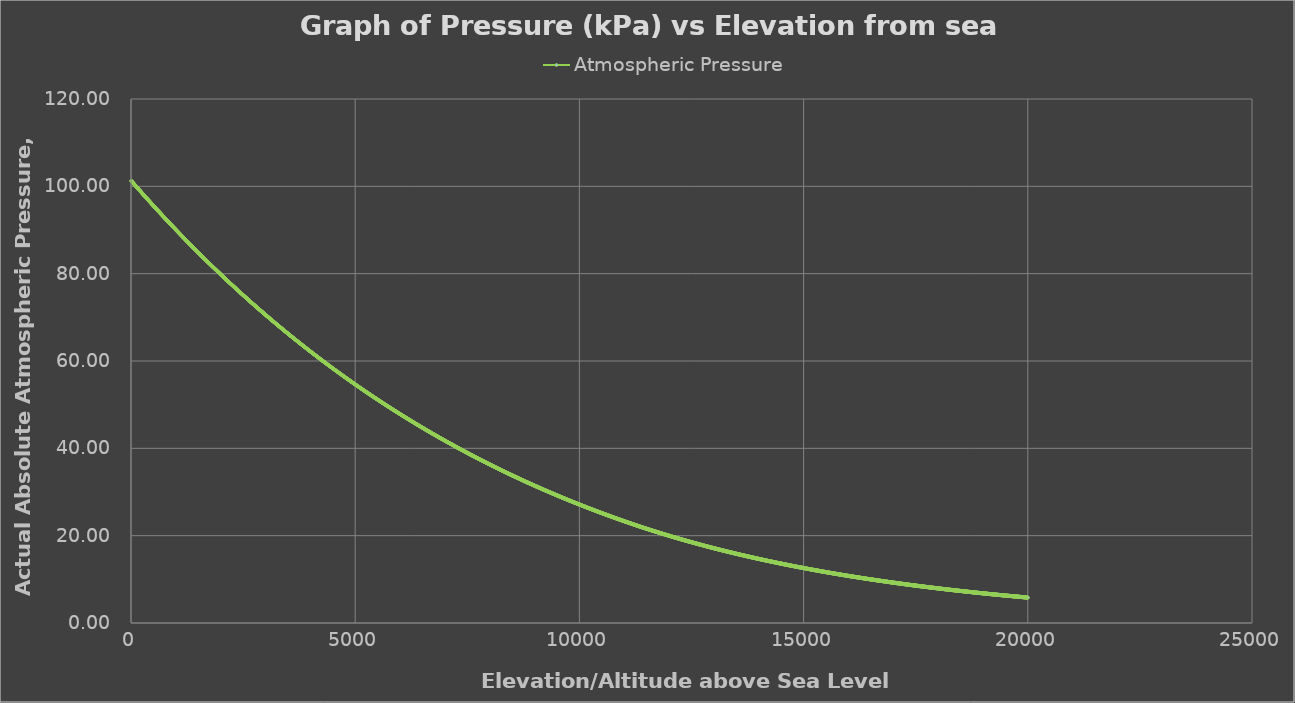
| Category | Atmospheric Pressure |
|---|---|
| 5.0 | 101.266 |
| 10.0 | 101.207 |
| 15.0 | 101.148 |
| 20.0 | 101.089 |
| 25.0 | 101.03 |
| 30.0 | 100.971 |
| 35.0 | 100.912 |
| 40.0 | 100.854 |
| 45.0 | 100.795 |
| 50.0 | 100.736 |
| 55.0 | 100.677 |
| 60.0 | 100.619 |
| 65.0 | 100.56 |
| 70.0 | 100.501 |
| 75.0 | 100.443 |
| 80.0 | 100.384 |
| 85.0 | 100.325 |
| 90.0 | 100.267 |
| 95.0 | 100.208 |
| 100.0 | 100.15 |
| 105.0 | 100.091 |
| 110.0 | 100.033 |
| 115.0 | 99.974 |
| 120.0 | 99.916 |
| 125.0 | 99.858 |
| 130.0 | 99.799 |
| 135.0 | 99.741 |
| 140.0 | 99.683 |
| 145.0 | 99.624 |
| 150.0 | 99.566 |
| 155.0 | 99.508 |
| 160.0 | 99.45 |
| 165.0 | 99.392 |
| 170.0 | 99.334 |
| 175.0 | 99.276 |
| 180.0 | 99.217 |
| 185.0 | 99.159 |
| 190.0 | 99.101 |
| 195.0 | 99.043 |
| 200.0 | 98.986 |
| 205.0 | 98.928 |
| 210.0 | 98.87 |
| 215.0 | 98.812 |
| 220.0 | 98.754 |
| 225.0 | 98.696 |
| 230.0 | 98.638 |
| 235.0 | 98.581 |
| 240.0 | 98.523 |
| 245.0 | 98.465 |
| 250.0 | 98.408 |
| 255.0 | 98.35 |
| 260.0 | 98.292 |
| 265.0 | 98.235 |
| 270.0 | 98.177 |
| 275.0 | 98.12 |
| 280.0 | 98.062 |
| 285.0 | 98.005 |
| 290.0 | 97.947 |
| 295.0 | 97.89 |
| 300.0 | 97.832 |
| 305.0 | 97.775 |
| 310.0 | 97.718 |
| 315.0 | 97.66 |
| 320.0 | 97.603 |
| 325.0 | 97.546 |
| 330.0 | 97.488 |
| 335.0 | 97.431 |
| 340.0 | 97.374 |
| 345.0 | 97.317 |
| 350.0 | 97.26 |
| 355.0 | 97.203 |
| 360.0 | 97.146 |
| 365.0 | 97.089 |
| 370.0 | 97.032 |
| 375.0 | 96.975 |
| 380.0 | 96.918 |
| 385.0 | 96.861 |
| 390.0 | 96.804 |
| 395.0 | 96.747 |
| 400.0 | 96.69 |
| 405.0 | 96.633 |
| 410.0 | 96.576 |
| 415.0 | 96.52 |
| 420.0 | 96.463 |
| 425.0 | 96.406 |
| 430.0 | 96.349 |
| 435.0 | 96.293 |
| 440.0 | 96.236 |
| 445.0 | 96.179 |
| 450.0 | 96.123 |
| 455.0 | 96.066 |
| 460.0 | 96.01 |
| 465.0 | 95.953 |
| 470.0 | 95.897 |
| 475.0 | 95.84 |
| 480.0 | 95.784 |
| 485.0 | 95.728 |
| 490.0 | 95.671 |
| 495.0 | 95.615 |
| 500.0 | 95.559 |
| 505.0 | 95.502 |
| 510.0 | 95.446 |
| 515.0 | 95.39 |
| 520.0 | 95.333 |
| 525.0 | 95.277 |
| 530.0 | 95.221 |
| 535.0 | 95.165 |
| 540.0 | 95.109 |
| 545.0 | 95.053 |
| 550.0 | 94.997 |
| 555.0 | 94.941 |
| 560.0 | 94.885 |
| 565.0 | 94.829 |
| 570.0 | 94.773 |
| 575.0 | 94.717 |
| 580.0 | 94.661 |
| 585.0 | 94.605 |
| 590.0 | 94.549 |
| 595.0 | 94.494 |
| 600.0 | 94.438 |
| 605.0 | 94.382 |
| 610.0 | 94.326 |
| 615.0 | 94.271 |
| 620.0 | 94.215 |
| 625.0 | 94.159 |
| 630.0 | 94.104 |
| 635.0 | 94.048 |
| 640.0 | 93.992 |
| 645.0 | 93.937 |
| 650.0 | 93.881 |
| 655.0 | 93.826 |
| 660.0 | 93.77 |
| 665.0 | 93.715 |
| 670.0 | 93.66 |
| 675.0 | 93.604 |
| 680.0 | 93.549 |
| 685.0 | 93.494 |
| 690.0 | 93.438 |
| 695.0 | 93.383 |
| 700.0 | 93.328 |
| 705.0 | 93.272 |
| 710.0 | 93.217 |
| 715.0 | 93.162 |
| 720.0 | 93.107 |
| 725.0 | 93.052 |
| 730.0 | 92.997 |
| 735.0 | 92.942 |
| 740.0 | 92.887 |
| 745.0 | 92.832 |
| 750.0 | 92.777 |
| 755.0 | 92.722 |
| 760.0 | 92.667 |
| 765.0 | 92.612 |
| 770.0 | 92.557 |
| 775.0 | 92.502 |
| 780.0 | 92.447 |
| 785.0 | 92.392 |
| 790.0 | 92.338 |
| 795.0 | 92.283 |
| 800.0 | 92.228 |
| 805.0 | 92.173 |
| 810.0 | 92.119 |
| 815.0 | 92.064 |
| 820.0 | 92.01 |
| 825.0 | 91.955 |
| 830.0 | 91.9 |
| 835.0 | 91.846 |
| 840.0 | 91.791 |
| 845.0 | 91.737 |
| 850.0 | 91.682 |
| 855.0 | 91.628 |
| 860.0 | 91.574 |
| 865.0 | 91.519 |
| 870.0 | 91.465 |
| 875.0 | 91.41 |
| 880.0 | 91.356 |
| 885.0 | 91.302 |
| 890.0 | 91.248 |
| 895.0 | 91.193 |
| 900.0 | 91.139 |
| 905.0 | 91.085 |
| 910.0 | 91.031 |
| 915.0 | 90.977 |
| 920.0 | 90.923 |
| 925.0 | 90.869 |
| 930.0 | 90.815 |
| 935.0 | 90.761 |
| 940.0 | 90.707 |
| 945.0 | 90.653 |
| 950.0 | 90.599 |
| 955.0 | 90.545 |
| 960.0 | 90.491 |
| 965.0 | 90.437 |
| 970.0 | 90.383 |
| 975.0 | 90.329 |
| 980.0 | 90.276 |
| 985.0 | 90.222 |
| 990.0 | 90.168 |
| 995.0 | 90.114 |
| 1000.0 | 90.061 |
| 1005.0 | 90.007 |
| 1010.0 | 89.953 |
| 1015.0 | 89.9 |
| 1020.0 | 89.846 |
| 1025.0 | 89.793 |
| 1030.0 | 89.739 |
| 1035.0 | 89.686 |
| 1040.0 | 89.632 |
| 1045.0 | 89.579 |
| 1050.0 | 89.525 |
| 1055.0 | 89.472 |
| 1060.0 | 89.419 |
| 1065.0 | 89.365 |
| 1070.0 | 89.312 |
| 1075.0 | 89.259 |
| 1080.0 | 89.205 |
| 1085.0 | 89.152 |
| 1090.0 | 89.099 |
| 1095.0 | 89.046 |
| 1100.0 | 88.992 |
| 1105.0 | 88.939 |
| 1110.0 | 88.886 |
| 1115.0 | 88.833 |
| 1120.0 | 88.78 |
| 1125.0 | 88.727 |
| 1130.0 | 88.674 |
| 1135.0 | 88.621 |
| 1140.0 | 88.568 |
| 1145.0 | 88.515 |
| 1150.0 | 88.462 |
| 1155.0 | 88.409 |
| 1160.0 | 88.357 |
| 1165.0 | 88.304 |
| 1170.0 | 88.251 |
| 1175.0 | 88.198 |
| 1180.0 | 88.145 |
| 1185.0 | 88.093 |
| 1190.0 | 88.04 |
| 1195.0 | 87.987 |
| 1200.0 | 87.935 |
| 1205.0 | 87.882 |
| 1210.0 | 87.829 |
| 1215.0 | 87.777 |
| 1220.0 | 87.724 |
| 1225.0 | 87.672 |
| 1230.0 | 87.619 |
| 1235.0 | 87.567 |
| 1240.0 | 87.514 |
| 1245.0 | 87.462 |
| 1250.0 | 87.409 |
| 1255.0 | 87.357 |
| 1260.0 | 87.305 |
| 1265.0 | 87.252 |
| 1270.0 | 87.2 |
| 1275.0 | 87.148 |
| 1280.0 | 87.096 |
| 1285.0 | 87.043 |
| 1290.0 | 86.991 |
| 1295.0 | 86.939 |
| 1300.0 | 86.887 |
| 1305.0 | 86.835 |
| 1310.0 | 86.783 |
| 1315.0 | 86.731 |
| 1320.0 | 86.679 |
| 1325.0 | 86.627 |
| 1330.0 | 86.575 |
| 1335.0 | 86.523 |
| 1340.0 | 86.471 |
| 1345.0 | 86.419 |
| 1350.0 | 86.367 |
| 1355.0 | 86.315 |
| 1360.0 | 86.263 |
| 1365.0 | 86.211 |
| 1370.0 | 86.16 |
| 1375.0 | 86.108 |
| 1380.0 | 86.056 |
| 1385.0 | 86.004 |
| 1390.0 | 85.953 |
| 1395.0 | 85.901 |
| 1400.0 | 85.849 |
| 1405.0 | 85.798 |
| 1410.0 | 85.746 |
| 1415.0 | 85.695 |
| 1420.0 | 85.643 |
| 1425.0 | 85.591 |
| 1430.0 | 85.54 |
| 1435.0 | 85.489 |
| 1440.0 | 85.437 |
| 1445.0 | 85.386 |
| 1450.0 | 85.334 |
| 1455.0 | 85.283 |
| 1460.0 | 85.232 |
| 1465.0 | 85.18 |
| 1470.0 | 85.129 |
| 1475.0 | 85.078 |
| 1480.0 | 85.027 |
| 1485.0 | 84.975 |
| 1490.0 | 84.924 |
| 1495.0 | 84.873 |
| 1500.0 | 84.822 |
| 1505.0 | 84.771 |
| 1510.0 | 84.72 |
| 1515.0 | 84.669 |
| 1520.0 | 84.618 |
| 1525.0 | 84.566 |
| 1530.0 | 84.516 |
| 1535.0 | 84.465 |
| 1540.0 | 84.414 |
| 1545.0 | 84.363 |
| 1550.0 | 84.312 |
| 1555.0 | 84.261 |
| 1560.0 | 84.21 |
| 1565.0 | 84.159 |
| 1570.0 | 84.108 |
| 1575.0 | 84.058 |
| 1580.0 | 84.007 |
| 1585.0 | 83.956 |
| 1590.0 | 83.906 |
| 1595.0 | 83.855 |
| 1600.0 | 83.804 |
| 1605.0 | 83.754 |
| 1610.0 | 83.703 |
| 1615.0 | 83.653 |
| 1620.0 | 83.602 |
| 1625.0 | 83.551 |
| 1630.0 | 83.501 |
| 1635.0 | 83.45 |
| 1640.0 | 83.4 |
| 1645.0 | 83.35 |
| 1650.0 | 83.299 |
| 1655.0 | 83.249 |
| 1660.0 | 83.199 |
| 1665.0 | 83.148 |
| 1670.0 | 83.098 |
| 1675.0 | 83.048 |
| 1680.0 | 82.997 |
| 1685.0 | 82.947 |
| 1690.0 | 82.897 |
| 1695.0 | 82.847 |
| 1700.0 | 82.797 |
| 1705.0 | 82.747 |
| 1710.0 | 82.696 |
| 1715.0 | 82.646 |
| 1720.0 | 82.596 |
| 1725.0 | 82.546 |
| 1730.0 | 82.496 |
| 1735.0 | 82.446 |
| 1740.0 | 82.396 |
| 1745.0 | 82.346 |
| 1750.0 | 82.297 |
| 1755.0 | 82.247 |
| 1760.0 | 82.197 |
| 1765.0 | 82.147 |
| 1770.0 | 82.097 |
| 1775.0 | 82.047 |
| 1780.0 | 81.998 |
| 1785.0 | 81.948 |
| 1790.0 | 81.898 |
| 1795.0 | 81.849 |
| 1800.0 | 81.799 |
| 1805.0 | 81.749 |
| 1810.0 | 81.7 |
| 1815.0 | 81.65 |
| 1820.0 | 81.6 |
| 1825.0 | 81.551 |
| 1830.0 | 81.501 |
| 1835.0 | 81.452 |
| 1840.0 | 81.402 |
| 1845.0 | 81.353 |
| 1850.0 | 81.304 |
| 1855.0 | 81.254 |
| 1860.0 | 81.205 |
| 1865.0 | 81.156 |
| 1870.0 | 81.106 |
| 1875.0 | 81.057 |
| 1880.0 | 81.008 |
| 1885.0 | 80.958 |
| 1890.0 | 80.909 |
| 1895.0 | 80.86 |
| 1900.0 | 80.811 |
| 1905.0 | 80.762 |
| 1910.0 | 80.713 |
| 1915.0 | 80.663 |
| 1920.0 | 80.614 |
| 1925.0 | 80.565 |
| 1930.0 | 80.516 |
| 1935.0 | 80.467 |
| 1940.0 | 80.418 |
| 1945.0 | 80.369 |
| 1950.0 | 80.32 |
| 1955.0 | 80.272 |
| 1960.0 | 80.223 |
| 1965.0 | 80.174 |
| 1970.0 | 80.125 |
| 1975.0 | 80.076 |
| 1980.0 | 80.027 |
| 1985.0 | 79.979 |
| 1990.0 | 79.93 |
| 1995.0 | 79.881 |
| 2000.0 | 79.832 |
| 2005.0 | 79.784 |
| 2010.0 | 79.735 |
| 2015.0 | 79.687 |
| 2020.0 | 79.638 |
| 2025.0 | 79.589 |
| 2030.0 | 79.541 |
| 2035.0 | 79.492 |
| 2040.0 | 79.444 |
| 2045.0 | 79.395 |
| 2050.0 | 79.347 |
| 2055.0 | 79.299 |
| 2060.0 | 79.25 |
| 2065.0 | 79.202 |
| 2070.0 | 79.153 |
| 2075.0 | 79.105 |
| 2080.0 | 79.057 |
| 2085.0 | 79.008 |
| 2090.0 | 78.96 |
| 2095.0 | 78.912 |
| 2100.0 | 78.864 |
| 2105.0 | 78.816 |
| 2110.0 | 78.767 |
| 2115.0 | 78.719 |
| 2120.0 | 78.671 |
| 2125.0 | 78.623 |
| 2130.0 | 78.575 |
| 2135.0 | 78.527 |
| 2140.0 | 78.479 |
| 2145.0 | 78.431 |
| 2150.0 | 78.383 |
| 2155.0 | 78.335 |
| 2160.0 | 78.287 |
| 2165.0 | 78.239 |
| 2170.0 | 78.191 |
| 2175.0 | 78.143 |
| 2180.0 | 78.096 |
| 2185.0 | 78.048 |
| 2190.0 | 78 |
| 2195.0 | 77.952 |
| 2200.0 | 77.905 |
| 2205.0 | 77.857 |
| 2210.0 | 77.809 |
| 2215.0 | 77.762 |
| 2220.0 | 77.714 |
| 2225.0 | 77.666 |
| 2230.0 | 77.619 |
| 2235.0 | 77.571 |
| 2240.0 | 77.524 |
| 2245.0 | 77.476 |
| 2250.0 | 77.429 |
| 2255.0 | 77.381 |
| 2260.0 | 77.334 |
| 2265.0 | 77.286 |
| 2270.0 | 77.239 |
| 2275.0 | 77.191 |
| 2280.0 | 77.144 |
| 2285.0 | 77.097 |
| 2290.0 | 77.049 |
| 2295.0 | 77.002 |
| 2300.0 | 76.955 |
| 2305.0 | 76.908 |
| 2310.0 | 76.86 |
| 2315.0 | 76.813 |
| 2320.0 | 76.766 |
| 2325.0 | 76.719 |
| 2330.0 | 76.672 |
| 2335.0 | 76.625 |
| 2340.0 | 76.578 |
| 2345.0 | 76.531 |
| 2350.0 | 76.484 |
| 2355.0 | 76.437 |
| 2360.0 | 76.39 |
| 2365.0 | 76.343 |
| 2370.0 | 76.296 |
| 2375.0 | 76.249 |
| 2380.0 | 76.202 |
| 2385.0 | 76.155 |
| 2390.0 | 76.108 |
| 2395.0 | 76.061 |
| 2400.0 | 76.015 |
| 2405.0 | 75.968 |
| 2410.0 | 75.921 |
| 2415.0 | 75.874 |
| 2420.0 | 75.828 |
| 2425.0 | 75.781 |
| 2430.0 | 75.734 |
| 2435.0 | 75.688 |
| 2440.0 | 75.641 |
| 2445.0 | 75.594 |
| 2450.0 | 75.548 |
| 2455.0 | 75.501 |
| 2460.0 | 75.455 |
| 2465.0 | 75.408 |
| 2470.0 | 75.362 |
| 2475.0 | 75.315 |
| 2480.0 | 75.269 |
| 2485.0 | 75.223 |
| 2490.0 | 75.176 |
| 2495.0 | 75.13 |
| 2500.0 | 75.084 |
| 2505.0 | 75.037 |
| 2510.0 | 74.991 |
| 2515.0 | 74.945 |
| 2520.0 | 74.898 |
| 2525.0 | 74.852 |
| 2530.0 | 74.806 |
| 2535.0 | 74.76 |
| 2540.0 | 74.714 |
| 2545.0 | 74.668 |
| 2550.0 | 74.621 |
| 2555.0 | 74.575 |
| 2560.0 | 74.529 |
| 2565.0 | 74.483 |
| 2570.0 | 74.437 |
| 2575.0 | 74.391 |
| 2580.0 | 74.345 |
| 2585.0 | 74.299 |
| 2590.0 | 74.254 |
| 2595.0 | 74.208 |
| 2600.0 | 74.162 |
| 2605.0 | 74.116 |
| 2610.0 | 74.07 |
| 2615.0 | 74.024 |
| 2620.0 | 73.979 |
| 2625.0 | 73.933 |
| 2630.0 | 73.887 |
| 2635.0 | 73.841 |
| 2640.0 | 73.796 |
| 2645.0 | 73.75 |
| 2650.0 | 73.704 |
| 2655.0 | 73.659 |
| 2660.0 | 73.613 |
| 2665.0 | 73.568 |
| 2670.0 | 73.522 |
| 2675.0 | 73.476 |
| 2680.0 | 73.431 |
| 2685.0 | 73.386 |
| 2690.0 | 73.34 |
| 2695.0 | 73.295 |
| 2700.0 | 73.249 |
| 2705.0 | 73.204 |
| 2710.0 | 73.158 |
| 2715.0 | 73.113 |
| 2720.0 | 73.068 |
| 2725.0 | 73.023 |
| 2730.0 | 72.977 |
| 2735.0 | 72.932 |
| 2740.0 | 72.887 |
| 2745.0 | 72.842 |
| 2750.0 | 72.796 |
| 2755.0 | 72.751 |
| 2760.0 | 72.706 |
| 2765.0 | 72.661 |
| 2770.0 | 72.616 |
| 2775.0 | 72.571 |
| 2780.0 | 72.526 |
| 2785.0 | 72.481 |
| 2790.0 | 72.436 |
| 2795.0 | 72.391 |
| 2800.0 | 72.346 |
| 2805.0 | 72.301 |
| 2810.0 | 72.256 |
| 2815.0 | 72.211 |
| 2820.0 | 72.166 |
| 2825.0 | 72.121 |
| 2830.0 | 72.077 |
| 2835.0 | 72.032 |
| 2840.0 | 71.987 |
| 2845.0 | 71.942 |
| 2850.0 | 71.897 |
| 2855.0 | 71.853 |
| 2860.0 | 71.808 |
| 2865.0 | 71.763 |
| 2870.0 | 71.719 |
| 2875.0 | 71.674 |
| 2880.0 | 71.63 |
| 2885.0 | 71.585 |
| 2890.0 | 71.54 |
| 2895.0 | 71.496 |
| 2900.0 | 71.451 |
| 2905.0 | 71.407 |
| 2910.0 | 71.362 |
| 2915.0 | 71.318 |
| 2920.0 | 71.274 |
| 2925.0 | 71.229 |
| 2930.0 | 71.185 |
| 2935.0 | 71.14 |
| 2940.0 | 71.096 |
| 2945.0 | 71.052 |
| 2950.0 | 71.008 |
| 2955.0 | 70.963 |
| 2960.0 | 70.919 |
| 2965.0 | 70.875 |
| 2970.0 | 70.831 |
| 2975.0 | 70.786 |
| 2980.0 | 70.742 |
| 2985.0 | 70.698 |
| 2990.0 | 70.654 |
| 2995.0 | 70.61 |
| 3000.0 | 70.566 |
| 3005.0 | 70.522 |
| 3010.0 | 70.478 |
| 3015.0 | 70.434 |
| 3020.0 | 70.39 |
| 3025.0 | 70.346 |
| 3030.0 | 70.302 |
| 3035.0 | 70.258 |
| 3040.0 | 70.214 |
| 3045.0 | 70.17 |
| 3050.0 | 70.127 |
| 3055.0 | 70.083 |
| 3060.0 | 70.039 |
| 3065.0 | 69.995 |
| 3070.0 | 69.951 |
| 3075.0 | 69.908 |
| 3080.0 | 69.864 |
| 3085.0 | 69.82 |
| 3090.0 | 69.777 |
| 3095.0 | 69.733 |
| 3100.0 | 69.689 |
| 3105.0 | 69.646 |
| 3110.0 | 69.602 |
| 3115.0 | 69.559 |
| 3120.0 | 69.515 |
| 3125.0 | 69.472 |
| 3130.0 | 69.428 |
| 3135.0 | 69.385 |
| 3140.0 | 69.341 |
| 3145.0 | 69.298 |
| 3150.0 | 69.254 |
| 3155.0 | 69.211 |
| 3160.0 | 69.168 |
| 3165.0 | 69.124 |
| 3170.0 | 69.081 |
| 3175.0 | 69.038 |
| 3180.0 | 68.995 |
| 3185.0 | 68.951 |
| 3190.0 | 68.908 |
| 3195.0 | 68.865 |
| 3200.0 | 68.822 |
| 3205.0 | 68.779 |
| 3210.0 | 68.735 |
| 3215.0 | 68.692 |
| 3220.0 | 68.649 |
| 3225.0 | 68.606 |
| 3230.0 | 68.563 |
| 3235.0 | 68.52 |
| 3240.0 | 68.477 |
| 3245.0 | 68.434 |
| 3250.0 | 68.391 |
| 3255.0 | 68.348 |
| 3260.0 | 68.305 |
| 3265.0 | 68.262 |
| 3270.0 | 68.22 |
| 3275.0 | 68.177 |
| 3280.0 | 68.134 |
| 3285.0 | 68.091 |
| 3290.0 | 68.048 |
| 3295.0 | 68.006 |
| 3300.0 | 67.963 |
| 3305.0 | 67.92 |
| 3310.0 | 67.877 |
| 3315.0 | 67.835 |
| 3320.0 | 67.792 |
| 3325.0 | 67.749 |
| 3330.0 | 67.707 |
| 3335.0 | 67.664 |
| 3340.0 | 67.622 |
| 3345.0 | 67.579 |
| 3350.0 | 67.537 |
| 3355.0 | 67.494 |
| 3360.0 | 67.452 |
| 3365.0 | 67.409 |
| 3370.0 | 67.367 |
| 3375.0 | 67.324 |
| 3380.0 | 67.282 |
| 3385.0 | 67.24 |
| 3390.0 | 67.197 |
| 3395.0 | 67.155 |
| 3400.0 | 67.113 |
| 3405.0 | 67.07 |
| 3410.0 | 67.028 |
| 3415.0 | 66.986 |
| 3420.0 | 66.944 |
| 3425.0 | 66.901 |
| 3430.0 | 66.859 |
| 3435.0 | 66.817 |
| 3440.0 | 66.775 |
| 3445.0 | 66.733 |
| 3450.0 | 66.691 |
| 3455.0 | 66.649 |
| 3460.0 | 66.607 |
| 3465.0 | 66.565 |
| 3470.0 | 66.523 |
| 3475.0 | 66.481 |
| 3480.0 | 66.439 |
| 3485.0 | 66.397 |
| 3490.0 | 66.355 |
| 3495.0 | 66.313 |
| 3500.0 | 66.271 |
| 3505.0 | 66.229 |
| 3510.0 | 66.187 |
| 3515.0 | 66.146 |
| 3520.0 | 66.104 |
| 3525.0 | 66.062 |
| 3530.0 | 66.02 |
| 3535.0 | 65.978 |
| 3540.0 | 65.937 |
| 3545.0 | 65.895 |
| 3550.0 | 65.853 |
| 3555.0 | 65.812 |
| 3560.0 | 65.77 |
| 3565.0 | 65.729 |
| 3570.0 | 65.687 |
| 3575.0 | 65.645 |
| 3580.0 | 65.604 |
| 3585.0 | 65.562 |
| 3590.0 | 65.521 |
| 3595.0 | 65.479 |
| 3600.0 | 65.438 |
| 3605.0 | 65.397 |
| 3610.0 | 65.355 |
| 3615.0 | 65.314 |
| 3620.0 | 65.272 |
| 3625.0 | 65.231 |
| 3630.0 | 65.19 |
| 3635.0 | 65.148 |
| 3640.0 | 65.107 |
| 3645.0 | 65.066 |
| 3650.0 | 65.025 |
| 3655.0 | 64.983 |
| 3660.0 | 64.942 |
| 3665.0 | 64.901 |
| 3670.0 | 64.86 |
| 3675.0 | 64.819 |
| 3680.0 | 64.778 |
| 3685.0 | 64.737 |
| 3690.0 | 64.696 |
| 3695.0 | 64.655 |
| 3700.0 | 64.613 |
| 3705.0 | 64.572 |
| 3710.0 | 64.531 |
| 3715.0 | 64.491 |
| 3720.0 | 64.45 |
| 3725.0 | 64.409 |
| 3730.0 | 64.368 |
| 3735.0 | 64.327 |
| 3740.0 | 64.286 |
| 3745.0 | 64.245 |
| 3750.0 | 64.204 |
| 3755.0 | 64.164 |
| 3760.0 | 64.123 |
| 3765.0 | 64.082 |
| 3770.0 | 64.041 |
| 3775.0 | 64.001 |
| 3780.0 | 63.96 |
| 3785.0 | 63.919 |
| 3790.0 | 63.879 |
| 3795.0 | 63.838 |
| 3800.0 | 63.797 |
| 3805.0 | 63.757 |
| 3810.0 | 63.716 |
| 3815.0 | 63.676 |
| 3820.0 | 63.635 |
| 3825.0 | 63.595 |
| 3830.0 | 63.554 |
| 3835.0 | 63.514 |
| 3840.0 | 63.473 |
| 3845.0 | 63.433 |
| 3850.0 | 63.392 |
| 3855.0 | 63.352 |
| 3860.0 | 63.312 |
| 3865.0 | 63.271 |
| 3870.0 | 63.231 |
| 3875.0 | 63.191 |
| 3880.0 | 63.151 |
| 3885.0 | 63.11 |
| 3890.0 | 63.07 |
| 3895.0 | 63.03 |
| 3900.0 | 62.99 |
| 3905.0 | 62.95 |
| 3910.0 | 62.909 |
| 3915.0 | 62.869 |
| 3920.0 | 62.829 |
| 3925.0 | 62.789 |
| 3930.0 | 62.749 |
| 3935.0 | 62.709 |
| 3940.0 | 62.669 |
| 3945.0 | 62.629 |
| 3950.0 | 62.589 |
| 3955.0 | 62.549 |
| 3960.0 | 62.509 |
| 3965.0 | 62.469 |
| 3970.0 | 62.429 |
| 3975.0 | 62.389 |
| 3980.0 | 62.349 |
| 3985.0 | 62.31 |
| 3990.0 | 62.27 |
| 3995.0 | 62.23 |
| 4000.0 | 62.19 |
| 4005.0 | 62.15 |
| 4010.0 | 62.111 |
| 4015.0 | 62.071 |
| 4020.0 | 62.031 |
| 4025.0 | 61.992 |
| 4030.0 | 61.952 |
| 4035.0 | 61.912 |
| 4040.0 | 61.873 |
| 4045.0 | 61.833 |
| 4050.0 | 61.794 |
| 4055.0 | 61.754 |
| 4060.0 | 61.715 |
| 4065.0 | 61.675 |
| 4070.0 | 61.636 |
| 4075.0 | 61.596 |
| 4080.0 | 61.557 |
| 4085.0 | 61.517 |
| 4090.0 | 61.478 |
| 4095.0 | 61.438 |
| 4100.0 | 61.399 |
| 4105.0 | 61.36 |
| 4110.0 | 61.32 |
| 4115.0 | 61.281 |
| 4120.0 | 61.242 |
| 4125.0 | 61.203 |
| 4130.0 | 61.163 |
| 4135.0 | 61.124 |
| 4140.0 | 61.085 |
| 4145.0 | 61.046 |
| 4150.0 | 61.007 |
| 4155.0 | 60.967 |
| 4160.0 | 60.928 |
| 4165.0 | 60.889 |
| 4170.0 | 60.85 |
| 4175.0 | 60.811 |
| 4180.0 | 60.772 |
| 4185.0 | 60.733 |
| 4190.0 | 60.694 |
| 4195.0 | 60.655 |
| 4200.0 | 60.616 |
| 4205.0 | 60.577 |
| 4210.0 | 60.538 |
| 4215.0 | 60.499 |
| 4220.0 | 60.46 |
| 4225.0 | 60.422 |
| 4230.0 | 60.383 |
| 4235.0 | 60.344 |
| 4240.0 | 60.305 |
| 4245.0 | 60.266 |
| 4250.0 | 60.228 |
| 4255.0 | 60.189 |
| 4260.0 | 60.15 |
| 4265.0 | 60.111 |
| 4270.0 | 60.073 |
| 4275.0 | 60.034 |
| 4280.0 | 59.995 |
| 4285.0 | 59.957 |
| 4290.0 | 59.918 |
| 4295.0 | 59.88 |
| 4300.0 | 59.841 |
| 4305.0 | 59.803 |
| 4310.0 | 59.764 |
| 4315.0 | 59.726 |
| 4320.0 | 59.687 |
| 4325.0 | 59.649 |
| 4330.0 | 59.61 |
| 4335.0 | 59.572 |
| 4340.0 | 59.533 |
| 4345.0 | 59.495 |
| 4350.0 | 59.457 |
| 4355.0 | 59.418 |
| 4360.0 | 59.38 |
| 4365.0 | 59.342 |
| 4370.0 | 59.304 |
| 4375.0 | 59.265 |
| 4380.0 | 59.227 |
| 4385.0 | 59.189 |
| 4390.0 | 59.151 |
| 4395.0 | 59.112 |
| 4400.0 | 59.074 |
| 4405.0 | 59.036 |
| 4410.0 | 58.998 |
| 4415.0 | 58.96 |
| 4420.0 | 58.922 |
| 4425.0 | 58.884 |
| 4430.0 | 58.846 |
| 4435.0 | 58.808 |
| 4440.0 | 58.77 |
| 4445.0 | 58.732 |
| 4450.0 | 58.694 |
| 4455.0 | 58.656 |
| 4460.0 | 58.618 |
| 4465.0 | 58.58 |
| 4470.0 | 58.542 |
| 4475.0 | 58.504 |
| 4480.0 | 58.467 |
| 4485.0 | 58.429 |
| 4490.0 | 58.391 |
| 4495.0 | 58.353 |
| 4500.0 | 58.315 |
| 4505.0 | 58.278 |
| 4510.0 | 58.24 |
| 4515.0 | 58.202 |
| 4520.0 | 58.165 |
| 4525.0 | 58.127 |
| 4530.0 | 58.089 |
| 4535.0 | 58.052 |
| 4540.0 | 58.014 |
| 4545.0 | 57.976 |
| 4550.0 | 57.939 |
| 4555.0 | 57.901 |
| 4560.0 | 57.864 |
| 4565.0 | 57.826 |
| 4570.0 | 57.789 |
| 4575.0 | 57.751 |
| 4580.0 | 57.714 |
| 4585.0 | 57.677 |
| 4590.0 | 57.639 |
| 4595.0 | 57.602 |
| 4600.0 | 57.564 |
| 4605.0 | 57.527 |
| 4610.0 | 57.49 |
| 4615.0 | 57.452 |
| 4620.0 | 57.415 |
| 4625.0 | 57.378 |
| 4630.0 | 57.341 |
| 4635.0 | 57.303 |
| 4640.0 | 57.266 |
| 4645.0 | 57.229 |
| 4650.0 | 57.192 |
| 4655.0 | 57.155 |
| 4660.0 | 57.118 |
| 4665.0 | 57.08 |
| 4670.0 | 57.043 |
| 4675.0 | 57.006 |
| 4680.0 | 56.969 |
| 4685.0 | 56.932 |
| 4690.0 | 56.895 |
| 4695.0 | 56.858 |
| 4700.0 | 56.821 |
| 4705.0 | 56.784 |
| 4710.0 | 56.747 |
| 4715.0 | 56.71 |
| 4720.0 | 56.674 |
| 4725.0 | 56.637 |
| 4730.0 | 56.6 |
| 4735.0 | 56.563 |
| 4740.0 | 56.526 |
| 4745.0 | 56.489 |
| 4750.0 | 56.453 |
| 4755.0 | 56.416 |
| 4760.0 | 56.379 |
| 4765.0 | 56.342 |
| 4770.0 | 56.306 |
| 4775.0 | 56.269 |
| 4780.0 | 56.232 |
| 4785.0 | 56.196 |
| 4790.0 | 56.159 |
| 4795.0 | 56.123 |
| 4800.0 | 56.086 |
| 4805.0 | 56.049 |
| 4810.0 | 56.013 |
| 4815.0 | 55.976 |
| 4820.0 | 55.94 |
| 4825.0 | 55.903 |
| 4830.0 | 55.867 |
| 4835.0 | 55.83 |
| 4840.0 | 55.794 |
| 4845.0 | 55.758 |
| 4850.0 | 55.721 |
| 4855.0 | 55.685 |
| 4860.0 | 55.648 |
| 4865.0 | 55.612 |
| 4870.0 | 55.576 |
| 4875.0 | 55.54 |
| 4880.0 | 55.503 |
| 4885.0 | 55.467 |
| 4890.0 | 55.431 |
| 4895.0 | 55.395 |
| 4900.0 | 55.358 |
| 4905.0 | 55.322 |
| 4910.0 | 55.286 |
| 4915.0 | 55.25 |
| 4920.0 | 55.214 |
| 4925.0 | 55.178 |
| 4930.0 | 55.142 |
| 4935.0 | 55.105 |
| 4940.0 | 55.069 |
| 4945.0 | 55.033 |
| 4950.0 | 54.997 |
| 4955.0 | 54.961 |
| 4960.0 | 54.925 |
| 4965.0 | 54.89 |
| 4970.0 | 54.854 |
| 4975.0 | 54.818 |
| 4980.0 | 54.782 |
| 4985.0 | 54.746 |
| 4990.0 | 54.71 |
| 4995.0 | 54.674 |
| 5000.0 | 54.638 |
| 5005.0 | 54.603 |
| 5010.0 | 54.567 |
| 5015.0 | 54.531 |
| 5020.0 | 54.495 |
| 5025.0 | 54.46 |
| 5030.0 | 54.424 |
| 5035.0 | 54.388 |
| 5040.0 | 54.353 |
| 5045.0 | 54.317 |
| 5050.0 | 54.281 |
| 5055.0 | 54.246 |
| 5060.0 | 54.21 |
| 5065.0 | 54.174 |
| 5070.0 | 54.139 |
| 5075.0 | 54.103 |
| 5080.0 | 54.068 |
| 5085.0 | 54.032 |
| 5090.0 | 53.997 |
| 5095.0 | 53.961 |
| 5100.0 | 53.926 |
| 5105.0 | 53.891 |
| 5110.0 | 53.855 |
| 5115.0 | 53.82 |
| 5120.0 | 53.784 |
| 5125.0 | 53.749 |
| 5130.0 | 53.714 |
| 5135.0 | 53.678 |
| 5140.0 | 53.643 |
| 5145.0 | 53.608 |
| 5150.0 | 53.573 |
| 5155.0 | 53.537 |
| 5160.0 | 53.502 |
| 5165.0 | 53.467 |
| 5170.0 | 53.432 |
| 5175.0 | 53.397 |
| 5180.0 | 53.362 |
| 5185.0 | 53.326 |
| 5190.0 | 53.291 |
| 5195.0 | 53.256 |
| 5200.0 | 53.221 |
| 5205.0 | 53.186 |
| 5210.0 | 53.151 |
| 5215.0 | 53.116 |
| 5220.0 | 53.081 |
| 5225.0 | 53.046 |
| 5230.0 | 53.011 |
| 5235.0 | 52.976 |
| 5240.0 | 52.941 |
| 5245.0 | 52.906 |
| 5250.0 | 52.872 |
| 5255.0 | 52.837 |
| 5260.0 | 52.802 |
| 5265.0 | 52.767 |
| 5270.0 | 52.732 |
| 5275.0 | 52.698 |
| 5280.0 | 52.663 |
| 5285.0 | 52.628 |
| 5290.0 | 52.593 |
| 5295.0 | 52.559 |
| 5300.0 | 52.524 |
| 5305.0 | 52.489 |
| 5310.0 | 52.455 |
| 5315.0 | 52.42 |
| 5320.0 | 52.385 |
| 5325.0 | 52.351 |
| 5330.0 | 52.316 |
| 5335.0 | 52.282 |
| 5340.0 | 52.247 |
| 5345.0 | 52.213 |
| 5350.0 | 52.178 |
| 5355.0 | 52.144 |
| 5360.0 | 52.109 |
| 5365.0 | 52.075 |
| 5370.0 | 52.04 |
| 5375.0 | 52.006 |
| 5380.0 | 51.971 |
| 5385.0 | 51.937 |
| 5390.0 | 51.903 |
| 5395.0 | 51.868 |
| 5400.0 | 51.834 |
| 5405.0 | 51.8 |
| 5410.0 | 51.765 |
| 5415.0 | 51.731 |
| 5420.0 | 51.697 |
| 5425.0 | 51.663 |
| 5430.0 | 51.628 |
| 5435.0 | 51.594 |
| 5440.0 | 51.56 |
| 5445.0 | 51.526 |
| 5450.0 | 51.492 |
| 5455.0 | 51.458 |
| 5460.0 | 51.424 |
| 5465.0 | 51.389 |
| 5470.0 | 51.355 |
| 5475.0 | 51.321 |
| 5480.0 | 51.287 |
| 5485.0 | 51.253 |
| 5490.0 | 51.219 |
| 5495.0 | 51.185 |
| 5500.0 | 51.151 |
| 5505.0 | 51.117 |
| 5510.0 | 51.084 |
| 5515.0 | 51.05 |
| 5520.0 | 51.016 |
| 5525.0 | 50.982 |
| 5530.0 | 50.948 |
| 5535.0 | 50.914 |
| 5540.0 | 50.88 |
| 5545.0 | 50.847 |
| 5550.0 | 50.813 |
| 5555.0 | 50.779 |
| 5560.0 | 50.745 |
| 5565.0 | 50.712 |
| 5570.0 | 50.678 |
| 5575.0 | 50.644 |
| 5580.0 | 50.611 |
| 5585.0 | 50.577 |
| 5590.0 | 50.543 |
| 5595.0 | 50.51 |
| 5600.0 | 50.476 |
| 5605.0 | 50.443 |
| 5610.0 | 50.409 |
| 5615.0 | 50.375 |
| 5620.0 | 50.342 |
| 5625.0 | 50.308 |
| 5630.0 | 50.275 |
| 5635.0 | 50.242 |
| 5640.0 | 50.208 |
| 5645.0 | 50.175 |
| 5650.0 | 50.141 |
| 5655.0 | 50.108 |
| 5660.0 | 50.074 |
| 5665.0 | 50.041 |
| 5670.0 | 50.008 |
| 5675.0 | 49.974 |
| 5680.0 | 49.941 |
| 5685.0 | 49.908 |
| 5690.0 | 49.875 |
| 5695.0 | 49.841 |
| 5700.0 | 49.808 |
| 5705.0 | 49.775 |
| 5710.0 | 49.742 |
| 5715.0 | 49.709 |
| 5720.0 | 49.675 |
| 5725.0 | 49.642 |
| 5730.0 | 49.609 |
| 5735.0 | 49.576 |
| 5740.0 | 49.543 |
| 5745.0 | 49.51 |
| 5750.0 | 49.477 |
| 5755.0 | 49.444 |
| 5760.0 | 49.411 |
| 5765.0 | 49.378 |
| 5770.0 | 49.345 |
| 5775.0 | 49.312 |
| 5780.0 | 49.279 |
| 5785.0 | 49.246 |
| 5790.0 | 49.213 |
| 5795.0 | 49.18 |
| 5800.0 | 49.147 |
| 5805.0 | 49.114 |
| 5810.0 | 49.082 |
| 5815.0 | 49.049 |
| 5820.0 | 49.016 |
| 5825.0 | 48.983 |
| 5830.0 | 48.95 |
| 5835.0 | 48.918 |
| 5840.0 | 48.885 |
| 5845.0 | 48.852 |
| 5850.0 | 48.82 |
| 5855.0 | 48.787 |
| 5860.0 | 48.754 |
| 5865.0 | 48.722 |
| 5870.0 | 48.689 |
| 5875.0 | 48.656 |
| 5880.0 | 48.624 |
| 5885.0 | 48.591 |
| 5890.0 | 48.559 |
| 5895.0 | 48.526 |
| 5900.0 | 48.494 |
| 5905.0 | 48.461 |
| 5910.0 | 48.429 |
| 5915.0 | 48.396 |
| 5920.0 | 48.364 |
| 5925.0 | 48.331 |
| 5930.0 | 48.299 |
| 5935.0 | 48.266 |
| 5940.0 | 48.234 |
| 5945.0 | 48.202 |
| 5950.0 | 48.169 |
| 5955.0 | 48.137 |
| 5960.0 | 48.105 |
| 5965.0 | 48.072 |
| 5970.0 | 48.04 |
| 5975.0 | 48.008 |
| 5980.0 | 47.976 |
| 5985.0 | 47.943 |
| 5990.0 | 47.911 |
| 5995.0 | 47.879 |
| 6000.0 | 47.847 |
| 6005.0 | 47.815 |
| 6010.0 | 47.783 |
| 6015.0 | 47.75 |
| 6020.0 | 47.718 |
| 6025.0 | 47.686 |
| 6030.0 | 47.654 |
| 6035.0 | 47.622 |
| 6040.0 | 47.59 |
| 6045.0 | 47.558 |
| 6050.0 | 47.526 |
| 6055.0 | 47.494 |
| 6060.0 | 47.462 |
| 6065.0 | 47.43 |
| 6070.0 | 47.398 |
| 6075.0 | 47.366 |
| 6080.0 | 47.335 |
| 6085.0 | 47.303 |
| 6090.0 | 47.271 |
| 6095.0 | 47.239 |
| 6100.0 | 47.207 |
| 6105.0 | 47.175 |
| 6110.0 | 47.144 |
| 6115.0 | 47.112 |
| 6120.0 | 47.08 |
| 6125.0 | 47.048 |
| 6130.0 | 47.017 |
| 6135.0 | 46.985 |
| 6140.0 | 46.953 |
| 6145.0 | 46.922 |
| 6150.0 | 46.89 |
| 6155.0 | 46.858 |
| 6160.0 | 46.827 |
| 6165.0 | 46.795 |
| 6170.0 | 46.764 |
| 6175.0 | 46.732 |
| 6180.0 | 46.7 |
| 6185.0 | 46.669 |
| 6190.0 | 46.637 |
| 6195.0 | 46.606 |
| 6200.0 | 46.574 |
| 6205.0 | 46.543 |
| 6210.0 | 46.512 |
| 6215.0 | 46.48 |
| 6220.0 | 46.449 |
| 6225.0 | 46.417 |
| 6230.0 | 46.386 |
| 6235.0 | 46.355 |
| 6240.0 | 46.323 |
| 6245.0 | 46.292 |
| 6250.0 | 46.261 |
| 6255.0 | 46.229 |
| 6260.0 | 46.198 |
| 6265.0 | 46.167 |
| 6270.0 | 46.136 |
| 6275.0 | 46.104 |
| 6280.0 | 46.073 |
| 6285.0 | 46.042 |
| 6290.0 | 46.011 |
| 6295.0 | 45.98 |
| 6300.0 | 45.949 |
| 6305.0 | 45.917 |
| 6310.0 | 45.886 |
| 6315.0 | 45.855 |
| 6320.0 | 45.824 |
| 6325.0 | 45.793 |
| 6330.0 | 45.762 |
| 6335.0 | 45.731 |
| 6340.0 | 45.7 |
| 6345.0 | 45.669 |
| 6350.0 | 45.638 |
| 6355.0 | 45.607 |
| 6360.0 | 45.576 |
| 6365.0 | 45.545 |
| 6370.0 | 45.515 |
| 6375.0 | 45.484 |
| 6380.0 | 45.453 |
| 6385.0 | 45.422 |
| 6390.0 | 45.391 |
| 6395.0 | 45.36 |
| 6400.0 | 45.33 |
| 6405.0 | 45.299 |
| 6410.0 | 45.268 |
| 6415.0 | 45.237 |
| 6420.0 | 45.207 |
| 6425.0 | 45.176 |
| 6430.0 | 45.145 |
| 6435.0 | 45.115 |
| 6440.0 | 45.084 |
| 6445.0 | 45.053 |
| 6450.0 | 45.023 |
| 6455.0 | 44.992 |
| 6460.0 | 44.961 |
| 6465.0 | 44.931 |
| 6470.0 | 44.9 |
| 6475.0 | 44.87 |
| 6480.0 | 44.839 |
| 6485.0 | 44.809 |
| 6490.0 | 44.778 |
| 6495.0 | 44.748 |
| 6500.0 | 44.717 |
| 6505.0 | 44.687 |
| 6510.0 | 44.656 |
| 6515.0 | 44.626 |
| 6520.0 | 44.596 |
| 6525.0 | 44.565 |
| 6530.0 | 44.535 |
| 6535.0 | 44.505 |
| 6540.0 | 44.474 |
| 6545.0 | 44.444 |
| 6550.0 | 44.414 |
| 6555.0 | 44.383 |
| 6560.0 | 44.353 |
| 6565.0 | 44.323 |
| 6570.0 | 44.293 |
| 6575.0 | 44.263 |
| 6580.0 | 44.232 |
| 6585.0 | 44.202 |
| 6590.0 | 44.172 |
| 6595.0 | 44.142 |
| 6600.0 | 44.112 |
| 6605.0 | 44.082 |
| 6610.0 | 44.052 |
| 6615.0 | 44.022 |
| 6620.0 | 43.991 |
| 6625.0 | 43.961 |
| 6630.0 | 43.931 |
| 6635.0 | 43.901 |
| 6640.0 | 43.871 |
| 6645.0 | 43.841 |
| 6650.0 | 43.812 |
| 6655.0 | 43.782 |
| 6660.0 | 43.752 |
| 6665.0 | 43.722 |
| 6670.0 | 43.692 |
| 6675.0 | 43.662 |
| 6680.0 | 43.632 |
| 6685.0 | 43.602 |
| 6690.0 | 43.573 |
| 6695.0 | 43.543 |
| 6700.0 | 43.513 |
| 6705.0 | 43.483 |
| 6710.0 | 43.453 |
| 6715.0 | 43.424 |
| 6720.0 | 43.394 |
| 6725.0 | 43.364 |
| 6730.0 | 43.335 |
| 6735.0 | 43.305 |
| 6740.0 | 43.275 |
| 6745.0 | 43.246 |
| 6750.0 | 43.216 |
| 6755.0 | 43.186 |
| 6760.0 | 43.157 |
| 6765.0 | 43.127 |
| 6770.0 | 43.098 |
| 6775.0 | 43.068 |
| 6780.0 | 43.039 |
| 6785.0 | 43.009 |
| 6790.0 | 42.98 |
| 6795.0 | 42.95 |
| 6800.0 | 42.921 |
| 6805.0 | 42.891 |
| 6810.0 | 42.862 |
| 6815.0 | 42.832 |
| 6820.0 | 42.803 |
| 6825.0 | 42.774 |
| 6830.0 | 42.744 |
| 6835.0 | 42.715 |
| 6840.0 | 42.686 |
| 6845.0 | 42.656 |
| 6850.0 | 42.627 |
| 6855.0 | 42.598 |
| 6860.0 | 42.568 |
| 6865.0 | 42.539 |
| 6870.0 | 42.51 |
| 6875.0 | 42.481 |
| 6880.0 | 42.452 |
| 6885.0 | 42.422 |
| 6890.0 | 42.393 |
| 6895.0 | 42.364 |
| 6900.0 | 42.335 |
| 6905.0 | 42.306 |
| 6910.0 | 42.277 |
| 6915.0 | 42.248 |
| 6920.0 | 42.219 |
| 6925.0 | 42.189 |
| 6930.0 | 42.16 |
| 6935.0 | 42.131 |
| 6940.0 | 42.102 |
| 6945.0 | 42.073 |
| 6950.0 | 42.044 |
| 6955.0 | 42.016 |
| 6960.0 | 41.987 |
| 6965.0 | 41.958 |
| 6970.0 | 41.929 |
| 6975.0 | 41.9 |
| 6980.0 | 41.871 |
| 6985.0 | 41.842 |
| 6990.0 | 41.813 |
| 6995.0 | 41.784 |
| 7000.0 | 41.756 |
| 7005.0 | 41.727 |
| 7010.0 | 41.698 |
| 7015.0 | 41.669 |
| 7020.0 | 41.641 |
| 7025.0 | 41.612 |
| 7030.0 | 41.583 |
| 7035.0 | 41.554 |
| 7040.0 | 41.526 |
| 7045.0 | 41.497 |
| 7050.0 | 41.468 |
| 7055.0 | 41.44 |
| 7060.0 | 41.411 |
| 7065.0 | 41.383 |
| 7070.0 | 41.354 |
| 7075.0 | 41.325 |
| 7080.0 | 41.297 |
| 7085.0 | 41.268 |
| 7090.0 | 41.24 |
| 7095.0 | 41.211 |
| 7100.0 | 41.183 |
| 7105.0 | 41.154 |
| 7110.0 | 41.126 |
| 7115.0 | 41.097 |
| 7120.0 | 41.069 |
| 7125.0 | 41.041 |
| 7130.0 | 41.012 |
| 7135.0 | 40.984 |
| 7140.0 | 40.956 |
| 7145.0 | 40.927 |
| 7150.0 | 40.899 |
| 7155.0 | 40.871 |
| 7160.0 | 40.842 |
| 7165.0 | 40.814 |
| 7170.0 | 40.786 |
| 7175.0 | 40.757 |
| 7180.0 | 40.729 |
| 7185.0 | 40.701 |
| 7190.0 | 40.673 |
| 7195.0 | 40.645 |
| 7200.0 | 40.616 |
| 7205.0 | 40.588 |
| 7210.0 | 40.56 |
| 7215.0 | 40.532 |
| 7220.0 | 40.504 |
| 7225.0 | 40.476 |
| 7230.0 | 40.448 |
| 7235.0 | 40.42 |
| 7240.0 | 40.392 |
| 7245.0 | 40.364 |
| 7250.0 | 40.336 |
| 7255.0 | 40.308 |
| 7260.0 | 40.28 |
| 7265.0 | 40.252 |
| 7270.0 | 40.224 |
| 7275.0 | 40.196 |
| 7280.0 | 40.168 |
| 7285.0 | 40.14 |
| 7290.0 | 40.112 |
| 7295.0 | 40.084 |
| 7300.0 | 40.056 |
| 7305.0 | 40.028 |
| 7310.0 | 40.001 |
| 7315.0 | 39.973 |
| 7320.0 | 39.945 |
| 7325.0 | 39.917 |
| 7330.0 | 39.89 |
| 7335.0 | 39.862 |
| 7340.0 | 39.834 |
| 7345.0 | 39.806 |
| 7350.0 | 39.779 |
| 7355.0 | 39.751 |
| 7360.0 | 39.723 |
| 7365.0 | 39.696 |
| 7370.0 | 39.668 |
| 7375.0 | 39.64 |
| 7380.0 | 39.613 |
| 7385.0 | 39.585 |
| 7390.0 | 39.558 |
| 7395.0 | 39.53 |
| 7400.0 | 39.502 |
| 7405.0 | 39.475 |
| 7410.0 | 39.447 |
| 7415.0 | 39.42 |
| 7420.0 | 39.392 |
| 7425.0 | 39.365 |
| 7430.0 | 39.338 |
| 7435.0 | 39.31 |
| 7440.0 | 39.283 |
| 7445.0 | 39.255 |
| 7450.0 | 39.228 |
| 7455.0 | 39.201 |
| 7460.0 | 39.173 |
| 7465.0 | 39.146 |
| 7470.0 | 39.119 |
| 7475.0 | 39.091 |
| 7480.0 | 39.064 |
| 7485.0 | 39.037 |
| 7490.0 | 39.009 |
| 7495.0 | 38.982 |
| 7500.0 | 38.955 |
| 7505.0 | 38.928 |
| 7510.0 | 38.9 |
| 7515.0 | 38.873 |
| 7520.0 | 38.846 |
| 7525.0 | 38.819 |
| 7530.0 | 38.792 |
| 7535.0 | 38.765 |
| 7540.0 | 38.738 |
| 7545.0 | 38.71 |
| 7550.0 | 38.683 |
| 7555.0 | 38.656 |
| 7560.0 | 38.629 |
| 7565.0 | 38.602 |
| 7570.0 | 38.575 |
| 7575.0 | 38.548 |
| 7580.0 | 38.521 |
| 7585.0 | 38.494 |
| 7590.0 | 38.467 |
| 7595.0 | 38.44 |
| 7600.0 | 38.413 |
| 7605.0 | 38.387 |
| 7610.0 | 38.36 |
| 7615.0 | 38.333 |
| 7620.0 | 38.306 |
| 7625.0 | 38.279 |
| 7630.0 | 38.252 |
| 7635.0 | 38.225 |
| 7640.0 | 38.199 |
| 7645.0 | 38.172 |
| 7650.0 | 38.145 |
| 7655.0 | 38.118 |
| 7660.0 | 38.091 |
| 7665.0 | 38.065 |
| 7670.0 | 38.038 |
| 7675.0 | 38.011 |
| 7680.0 | 37.985 |
| 7685.0 | 37.958 |
| 7690.0 | 37.931 |
| 7695.0 | 37.905 |
| 7700.0 | 37.878 |
| 7705.0 | 37.851 |
| 7710.0 | 37.825 |
| 7715.0 | 37.798 |
| 7720.0 | 37.772 |
| 7725.0 | 37.745 |
| 7730.0 | 37.719 |
| 7735.0 | 37.692 |
| 7740.0 | 37.666 |
| 7745.0 | 37.639 |
| 7750.0 | 37.613 |
| 7755.0 | 37.586 |
| 7760.0 | 37.56 |
| 7765.0 | 37.533 |
| 7770.0 | 37.507 |
| 7775.0 | 37.481 |
| 7780.0 | 37.454 |
| 7785.0 | 37.428 |
| 7790.0 | 37.401 |
| 7795.0 | 37.375 |
| 7800.0 | 37.349 |
| 7805.0 | 37.322 |
| 7810.0 | 37.296 |
| 7815.0 | 37.27 |
| 7820.0 | 37.244 |
| 7825.0 | 37.217 |
| 7830.0 | 37.191 |
| 7835.0 | 37.165 |
| 7840.0 | 37.139 |
| 7845.0 | 37.113 |
| 7850.0 | 37.086 |
| 7855.0 | 37.06 |
| 7860.0 | 37.034 |
| 7865.0 | 37.008 |
| 7870.0 | 36.982 |
| 7875.0 | 36.956 |
| 7880.0 | 36.93 |
| 7885.0 | 36.904 |
| 7890.0 | 36.878 |
| 7895.0 | 36.852 |
| 7900.0 | 36.826 |
| 7905.0 | 36.8 |
| 7910.0 | 36.774 |
| 7915.0 | 36.748 |
| 7920.0 | 36.722 |
| 7925.0 | 36.696 |
| 7930.0 | 36.67 |
| 7935.0 | 36.644 |
| 7940.0 | 36.618 |
| 7945.0 | 36.592 |
| 7950.0 | 36.566 |
| 7955.0 | 36.54 |
| 7960.0 | 36.514 |
| 7965.0 | 36.489 |
| 7970.0 | 36.463 |
| 7975.0 | 36.437 |
| 7980.0 | 36.411 |
| 7985.0 | 36.385 |
| 7990.0 | 36.36 |
| 7995.0 | 36.334 |
| 8000.0 | 36.308 |
| 8005.0 | 36.282 |
| 8010.0 | 36.257 |
| 8015.0 | 36.231 |
| 8020.0 | 36.205 |
| 8025.0 | 36.18 |
| 8030.0 | 36.154 |
| 8035.0 | 36.129 |
| 8040.0 | 36.103 |
| 8045.0 | 36.077 |
| 8050.0 | 36.052 |
| 8055.0 | 36.026 |
| 8060.0 | 36.001 |
| 8065.0 | 35.975 |
| 8070.0 | 35.95 |
| 8075.0 | 35.924 |
| 8080.0 | 35.899 |
| 8085.0 | 35.873 |
| 8090.0 | 35.848 |
| 8095.0 | 35.822 |
| 8100.0 | 35.797 |
| 8105.0 | 35.771 |
| 8110.0 | 35.746 |
| 8115.0 | 35.721 |
| 8120.0 | 35.695 |
| 8125.0 | 35.67 |
| 8130.0 | 35.644 |
| 8135.0 | 35.619 |
| 8140.0 | 35.594 |
| 8145.0 | 35.569 |
| 8150.0 | 35.543 |
| 8155.0 | 35.518 |
| 8160.0 | 35.493 |
| 8165.0 | 35.467 |
| 8170.0 | 35.442 |
| 8175.0 | 35.417 |
| 8180.0 | 35.392 |
| 8185.0 | 35.367 |
| 8190.0 | 35.341 |
| 8195.0 | 35.316 |
| 8200.0 | 35.291 |
| 8205.0 | 35.266 |
| 8210.0 | 35.241 |
| 8215.0 | 35.216 |
| 8220.0 | 35.191 |
| 8225.0 | 35.166 |
| 8230.0 | 35.141 |
| 8235.0 | 35.116 |
| 8240.0 | 35.091 |
| 8245.0 | 35.066 |
| 8250.0 | 35.041 |
| 8255.0 | 35.016 |
| 8260.0 | 34.991 |
| 8265.0 | 34.966 |
| 8270.0 | 34.941 |
| 8275.0 | 34.916 |
| 8280.0 | 34.891 |
| 8285.0 | 34.866 |
| 8290.0 | 34.841 |
| 8295.0 | 34.816 |
| 8300.0 | 34.791 |
| 8305.0 | 34.767 |
| 8310.0 | 34.742 |
| 8315.0 | 34.717 |
| 8320.0 | 34.692 |
| 8325.0 | 34.667 |
| 8330.0 | 34.643 |
| 8335.0 | 34.618 |
| 8340.0 | 34.593 |
| 8345.0 | 34.568 |
| 8350.0 | 34.544 |
| 8355.0 | 34.519 |
| 8360.0 | 34.494 |
| 8365.0 | 34.47 |
| 8370.0 | 34.445 |
| 8375.0 | 34.42 |
| 8380.0 | 34.396 |
| 8385.0 | 34.371 |
| 8390.0 | 34.347 |
| 8395.0 | 34.322 |
| 8400.0 | 34.297 |
| 8405.0 | 34.273 |
| 8410.0 | 34.248 |
| 8415.0 | 34.224 |
| 8420.0 | 34.199 |
| 8425.0 | 34.175 |
| 8430.0 | 34.15 |
| 8435.0 | 34.126 |
| 8440.0 | 34.101 |
| 8445.0 | 34.077 |
| 8450.0 | 34.052 |
| 8455.0 | 34.028 |
| 8460.0 | 34.004 |
| 8465.0 | 33.979 |
| 8470.0 | 33.955 |
| 8475.0 | 33.931 |
| 8480.0 | 33.906 |
| 8485.0 | 33.882 |
| 8490.0 | 33.858 |
| 8495.0 | 33.833 |
| 8500.0 | 33.809 |
| 8505.0 | 33.785 |
| 8510.0 | 33.76 |
| 8515.0 | 33.736 |
| 8520.0 | 33.712 |
| 8525.0 | 33.688 |
| 8530.0 | 33.664 |
| 8535.0 | 33.639 |
| 8540.0 | 33.615 |
| 8545.0 | 33.591 |
| 8550.0 | 33.567 |
| 8555.0 | 33.543 |
| 8560.0 | 33.519 |
| 8565.0 | 33.495 |
| 8570.0 | 33.471 |
| 8575.0 | 33.446 |
| 8580.0 | 33.422 |
| 8585.0 | 33.398 |
| 8590.0 | 33.374 |
| 8595.0 | 33.35 |
| 8600.0 | 33.326 |
| 8605.0 | 33.302 |
| 8610.0 | 33.278 |
| 8615.0 | 33.254 |
| 8620.0 | 33.23 |
| 8625.0 | 33.207 |
| 8630.0 | 33.183 |
| 8635.0 | 33.159 |
| 8640.0 | 33.135 |
| 8645.0 | 33.111 |
| 8650.0 | 33.087 |
| 8655.0 | 33.063 |
| 8660.0 | 33.039 |
| 8665.0 | 33.016 |
| 8670.0 | 32.992 |
| 8675.0 | 32.968 |
| 8680.0 | 32.944 |
| 8685.0 | 32.92 |
| 8690.0 | 32.897 |
| 8695.0 | 32.873 |
| 8700.0 | 32.849 |
| 8705.0 | 32.826 |
| 8710.0 | 32.802 |
| 8715.0 | 32.778 |
| 8720.0 | 32.754 |
| 8725.0 | 32.731 |
| 8730.0 | 32.707 |
| 8735.0 | 32.684 |
| 8740.0 | 32.66 |
| 8745.0 | 32.636 |
| 8750.0 | 32.613 |
| 8755.0 | 32.589 |
| 8760.0 | 32.566 |
| 8765.0 | 32.542 |
| 8770.0 | 32.519 |
| 8775.0 | 32.495 |
| 8780.0 | 32.472 |
| 8785.0 | 32.448 |
| 8790.0 | 32.425 |
| 8795.0 | 32.401 |
| 8800.0 | 32.378 |
| 8805.0 | 32.354 |
| 8810.0 | 32.331 |
| 8815.0 | 32.307 |
| 8820.0 | 32.284 |
| 8825.0 | 32.261 |
| 8830.0 | 32.237 |
| 8835.0 | 32.214 |
| 8840.0 | 32.191 |
| 8845.0 | 32.167 |
| 8850.0 | 32.144 |
| 8855.0 | 32.121 |
| 8860.0 | 32.097 |
| 8865.0 | 32.074 |
| 8870.0 | 32.051 |
| 8875.0 | 32.028 |
| 8880.0 | 32.004 |
| 8885.0 | 31.981 |
| 8890.0 | 31.958 |
| 8895.0 | 31.935 |
| 8900.0 | 31.912 |
| 8905.0 | 31.888 |
| 8910.0 | 31.865 |
| 8915.0 | 31.842 |
| 8920.0 | 31.819 |
| 8925.0 | 31.796 |
| 8930.0 | 31.773 |
| 8935.0 | 31.75 |
| 8940.0 | 31.727 |
| 8945.0 | 31.704 |
| 8950.0 | 31.681 |
| 8955.0 | 31.658 |
| 8960.0 | 31.635 |
| 8965.0 | 31.612 |
| 8970.0 | 31.589 |
| 8975.0 | 31.566 |
| 8980.0 | 31.543 |
| 8985.0 | 31.52 |
| 8990.0 | 31.497 |
| 8995.0 | 31.474 |
| 9000.0 | 31.451 |
| 9005.0 | 31.428 |
| 9010.0 | 31.405 |
| 9015.0 | 31.382 |
| 9020.0 | 31.36 |
| 9025.0 | 31.337 |
| 9030.0 | 31.314 |
| 9035.0 | 31.291 |
| 9040.0 | 31.268 |
| 9045.0 | 31.245 |
| 9050.0 | 31.223 |
| 9055.0 | 31.2 |
| 9060.0 | 31.177 |
| 9065.0 | 31.155 |
| 9070.0 | 31.132 |
| 9075.0 | 31.109 |
| 9080.0 | 31.086 |
| 9085.0 | 31.064 |
| 9090.0 | 31.041 |
| 9095.0 | 31.018 |
| 9100.0 | 30.996 |
| 9105.0 | 30.973 |
| 9110.0 | 30.951 |
| 9115.0 | 30.928 |
| 9120.0 | 30.905 |
| 9125.0 | 30.883 |
| 9130.0 | 30.86 |
| 9135.0 | 30.838 |
| 9140.0 | 30.815 |
| 9145.0 | 30.793 |
| 9150.0 | 30.77 |
| 9155.0 | 30.748 |
| 9160.0 | 30.725 |
| 9165.0 | 30.703 |
| 9170.0 | 30.68 |
| 9175.0 | 30.658 |
| 9180.0 | 30.635 |
| 9185.0 | 30.613 |
| 9190.0 | 30.591 |
| 9195.0 | 30.568 |
| 9200.0 | 30.546 |
| 9205.0 | 30.524 |
| 9210.0 | 30.501 |
| 9215.0 | 30.479 |
| 9220.0 | 30.457 |
| 9225.0 | 30.434 |
| 9230.0 | 30.412 |
| 9235.0 | 30.39 |
| 9240.0 | 30.367 |
| 9245.0 | 30.345 |
| 9250.0 | 30.323 |
| 9255.0 | 30.301 |
| 9260.0 | 30.279 |
| 9265.0 | 30.256 |
| 9270.0 | 30.234 |
| 9275.0 | 30.212 |
| 9280.0 | 30.19 |
| 9285.0 | 30.168 |
| 9290.0 | 30.146 |
| 9295.0 | 30.123 |
| 9300.0 | 30.101 |
| 9305.0 | 30.079 |
| 9310.0 | 30.057 |
| 9315.0 | 30.035 |
| 9320.0 | 30.013 |
| 9325.0 | 29.991 |
| 9330.0 | 29.969 |
| 9335.0 | 29.947 |
| 9340.0 | 29.925 |
| 9345.0 | 29.903 |
| 9350.0 | 29.881 |
| 9355.0 | 29.859 |
| 9360.0 | 29.837 |
| 9365.0 | 29.815 |
| 9370.0 | 29.793 |
| 9375.0 | 29.771 |
| 9380.0 | 29.75 |
| 9385.0 | 29.728 |
| 9390.0 | 29.706 |
| 9395.0 | 29.684 |
| 9400.0 | 29.662 |
| 9405.0 | 29.64 |
| 9410.0 | 29.618 |
| 9415.0 | 29.597 |
| 9420.0 | 29.575 |
| 9425.0 | 29.553 |
| 9430.0 | 29.531 |
| 9435.0 | 29.51 |
| 9440.0 | 29.488 |
| 9445.0 | 29.466 |
| 9450.0 | 29.444 |
| 9455.0 | 29.423 |
| 9460.0 | 29.401 |
| 9465.0 | 29.379 |
| 9470.0 | 29.358 |
| 9475.0 | 29.336 |
| 9480.0 | 29.314 |
| 9485.0 | 29.293 |
| 9490.0 | 29.271 |
| 9495.0 | 29.25 |
| 9500.0 | 29.228 |
| 9505.0 | 29.206 |
| 9510.0 | 29.185 |
| 9515.0 | 29.163 |
| 9520.0 | 29.142 |
| 9525.0 | 29.12 |
| 9530.0 | 29.099 |
| 9535.0 | 29.077 |
| 9540.0 | 29.056 |
| 9545.0 | 29.034 |
| 9550.0 | 29.013 |
| 9555.0 | 28.991 |
| 9560.0 | 28.97 |
| 9565.0 | 28.949 |
| 9570.0 | 28.927 |
| 9575.0 | 28.906 |
| 9580.0 | 28.884 |
| 9585.0 | 28.863 |
| 9590.0 | 28.842 |
| 9595.0 | 28.82 |
| 9600.0 | 28.799 |
| 9605.0 | 28.778 |
| 9610.0 | 28.756 |
| 9615.0 | 28.735 |
| 9620.0 | 28.714 |
| 9625.0 | 28.693 |
| 9630.0 | 28.671 |
| 9635.0 | 28.65 |
| 9640.0 | 28.629 |
| 9645.0 | 28.608 |
| 9650.0 | 28.586 |
| 9655.0 | 28.565 |
| 9660.0 | 28.544 |
| 9665.0 | 28.523 |
| 9670.0 | 28.502 |
| 9675.0 | 28.481 |
| 9680.0 | 28.46 |
| 9685.0 | 28.438 |
| 9690.0 | 28.417 |
| 9695.0 | 28.396 |
| 9700.0 | 28.375 |
| 9705.0 | 28.354 |
| 9710.0 | 28.333 |
| 9715.0 | 28.312 |
| 9720.0 | 28.291 |
| 9725.0 | 28.27 |
| 9730.0 | 28.249 |
| 9735.0 | 28.228 |
| 9740.0 | 28.207 |
| 9745.0 | 28.186 |
| 9750.0 | 28.165 |
| 9755.0 | 28.144 |
| 9760.0 | 28.123 |
| 9765.0 | 28.102 |
| 9770.0 | 28.082 |
| 9775.0 | 28.061 |
| 9780.0 | 28.04 |
| 9785.0 | 28.019 |
| 9790.0 | 27.998 |
| 9795.0 | 27.977 |
| 9800.0 | 27.956 |
| 9805.0 | 27.936 |
| 9810.0 | 27.915 |
| 9815.0 | 27.894 |
| 9820.0 | 27.873 |
| 9825.0 | 27.853 |
| 9830.0 | 27.832 |
| 9835.0 | 27.811 |
| 9840.0 | 27.79 |
| 9845.0 | 27.77 |
| 9850.0 | 27.749 |
| 9855.0 | 27.728 |
| 9860.0 | 27.708 |
| 9865.0 | 27.687 |
| 9870.0 | 27.666 |
| 9875.0 | 27.646 |
| 9880.0 | 27.625 |
| 9885.0 | 27.604 |
| 9890.0 | 27.584 |
| 9895.0 | 27.563 |
| 9900.0 | 27.543 |
| 9905.0 | 27.522 |
| 9910.0 | 27.502 |
| 9915.0 | 27.481 |
| 9920.0 | 27.461 |
| 9925.0 | 27.44 |
| 9930.0 | 27.42 |
| 9935.0 | 27.399 |
| 9940.0 | 27.379 |
| 9945.0 | 27.358 |
| 9950.0 | 27.338 |
| 9955.0 | 27.317 |
| 9960.0 | 27.297 |
| 9965.0 | 27.276 |
| 9970.0 | 27.256 |
| 9975.0 | 27.236 |
| 9980.0 | 27.215 |
| 9985.0 | 27.195 |
| 9990.0 | 27.175 |
| 9995.0 | 27.154 |
| 10000.0 | 27.134 |
| 10005.0 | 27.114 |
| 10010.0 | 27.093 |
| 10015.0 | 27.073 |
| 10020.0 | 27.053 |
| 10025.0 | 27.032 |
| 10030.0 | 27.012 |
| 10035.0 | 26.992 |
| 10040.0 | 26.972 |
| 10045.0 | 26.952 |
| 10050.0 | 26.931 |
| 10055.0 | 26.911 |
| 10060.0 | 26.891 |
| 10065.0 | 26.871 |
| 10070.0 | 26.851 |
| 10075.0 | 26.831 |
| 10080.0 | 26.81 |
| 10085.0 | 26.79 |
| 10090.0 | 26.77 |
| 10095.0 | 26.75 |
| 10100.0 | 26.73 |
| 10105.0 | 26.71 |
| 10110.0 | 26.69 |
| 10115.0 | 26.67 |
| 10120.0 | 26.65 |
| 10125.0 | 26.63 |
| 10130.0 | 26.61 |
| 10135.0 | 26.59 |
| 10140.0 | 26.57 |
| 10145.0 | 26.55 |
| 10150.0 | 26.53 |
| 10155.0 | 26.51 |
| 10160.0 | 26.49 |
| 10165.0 | 26.47 |
| 10170.0 | 26.45 |
| 10175.0 | 26.43 |
| 10180.0 | 26.411 |
| 10185.0 | 26.391 |
| 10190.0 | 26.371 |
| 10195.0 | 26.351 |
| 10200.0 | 26.331 |
| 10205.0 | 26.311 |
| 10210.0 | 26.291 |
| 10215.0 | 26.272 |
| 10220.0 | 26.252 |
| 10225.0 | 26.232 |
| 10230.0 | 26.212 |
| 10235.0 | 26.193 |
| 10240.0 | 26.173 |
| 10245.0 | 26.153 |
| 10250.0 | 26.133 |
| 10255.0 | 26.114 |
| 10260.0 | 26.094 |
| 10265.0 | 26.074 |
| 10270.0 | 26.055 |
| 10275.0 | 26.035 |
| 10280.0 | 26.015 |
| 10285.0 | 25.996 |
| 10290.0 | 25.976 |
| 10295.0 | 25.957 |
| 10300.0 | 25.937 |
| 10305.0 | 25.917 |
| 10310.0 | 25.898 |
| 10315.0 | 25.878 |
| 10320.0 | 25.859 |
| 10325.0 | 25.839 |
| 10330.0 | 25.82 |
| 10335.0 | 25.8 |
| 10340.0 | 25.781 |
| 10345.0 | 25.761 |
| 10350.0 | 25.742 |
| 10355.0 | 25.722 |
| 10360.0 | 25.703 |
| 10365.0 | 25.683 |
| 10370.0 | 25.664 |
| 10375.0 | 25.645 |
| 10380.0 | 25.625 |
| 10385.0 | 25.606 |
| 10390.0 | 25.586 |
| 10395.0 | 25.567 |
| 10400.0 | 25.548 |
| 10405.0 | 25.528 |
| 10410.0 | 25.509 |
| 10415.0 | 25.49 |
| 10420.0 | 25.47 |
| 10425.0 | 25.451 |
| 10430.0 | 25.432 |
| 10435.0 | 25.412 |
| 10440.0 | 25.393 |
| 10445.0 | 25.374 |
| 10450.0 | 25.355 |
| 10455.0 | 25.336 |
| 10460.0 | 25.316 |
| 10465.0 | 25.297 |
| 10470.0 | 25.278 |
| 10475.0 | 25.259 |
| 10480.0 | 25.24 |
| 10485.0 | 25.22 |
| 10490.0 | 25.201 |
| 10495.0 | 25.182 |
| 10500.0 | 25.163 |
| 10505.0 | 25.144 |
| 10510.0 | 25.125 |
| 10515.0 | 25.106 |
| 10520.0 | 25.087 |
| 10525.0 | 25.068 |
| 10530.0 | 25.049 |
| 10535.0 | 25.03 |
| 10540.0 | 25.011 |
| 10545.0 | 24.991 |
| 10550.0 | 24.972 |
| 10555.0 | 24.954 |
| 10560.0 | 24.935 |
| 10565.0 | 24.916 |
| 10570.0 | 24.897 |
| 10575.0 | 24.878 |
| 10580.0 | 24.859 |
| 10585.0 | 24.84 |
| 10590.0 | 24.821 |
| 10595.0 | 24.802 |
| 10600.0 | 24.783 |
| 10605.0 | 24.764 |
| 10610.0 | 24.745 |
| 10615.0 | 24.727 |
| 10620.0 | 24.708 |
| 10625.0 | 24.689 |
| 10630.0 | 24.67 |
| 10635.0 | 24.651 |
| 10640.0 | 24.632 |
| 10645.0 | 24.614 |
| 10650.0 | 24.595 |
| 10655.0 | 24.576 |
| 10660.0 | 24.557 |
| 10665.0 | 24.539 |
| 10670.0 | 24.52 |
| 10675.0 | 24.501 |
| 10680.0 | 24.483 |
| 10685.0 | 24.464 |
| 10690.0 | 24.445 |
| 10695.0 | 24.427 |
| 10700.0 | 24.408 |
| 10705.0 | 24.389 |
| 10710.0 | 24.371 |
| 10715.0 | 24.352 |
| 10720.0 | 24.333 |
| 10725.0 | 24.315 |
| 10730.0 | 24.296 |
| 10735.0 | 24.278 |
| 10740.0 | 24.259 |
| 10745.0 | 24.241 |
| 10750.0 | 24.222 |
| 10755.0 | 24.203 |
| 10760.0 | 24.185 |
| 10765.0 | 24.166 |
| 10770.0 | 24.148 |
| 10775.0 | 24.13 |
| 10780.0 | 24.111 |
| 10785.0 | 24.093 |
| 10790.0 | 24.074 |
| 10795.0 | 24.056 |
| 10800.0 | 24.037 |
| 10805.0 | 24.019 |
| 10810.0 | 24 |
| 10815.0 | 23.982 |
| 10820.0 | 23.964 |
| 10825.0 | 23.945 |
| 10830.0 | 23.927 |
| 10835.0 | 23.909 |
| 10840.0 | 23.89 |
| 10845.0 | 23.872 |
| 10850.0 | 23.854 |
| 10855.0 | 23.835 |
| 10860.0 | 23.817 |
| 10865.0 | 23.799 |
| 10870.0 | 23.781 |
| 10875.0 | 23.762 |
| 10880.0 | 23.744 |
| 10885.0 | 23.726 |
| 10890.0 | 23.708 |
| 10895.0 | 23.689 |
| 10900.0 | 23.671 |
| 10905.0 | 23.653 |
| 10910.0 | 23.635 |
| 10915.0 | 23.617 |
| 10920.0 | 23.599 |
| 10925.0 | 23.58 |
| 10930.0 | 23.562 |
| 10935.0 | 23.544 |
| 10940.0 | 23.526 |
| 10945.0 | 23.508 |
| 10950.0 | 23.49 |
| 10955.0 | 23.472 |
| 10960.0 | 23.454 |
| 10965.0 | 23.436 |
| 10970.0 | 23.418 |
| 10975.0 | 23.4 |
| 10980.0 | 23.382 |
| 10985.0 | 23.364 |
| 10990.0 | 23.346 |
| 10995.0 | 23.328 |
| 11000.0 | 23.31 |
| 11005.0 | 23.292 |
| 11010.0 | 23.274 |
| 11015.0 | 23.256 |
| 11020.0 | 23.238 |
| 11025.0 | 23.22 |
| 11030.0 | 23.202 |
| 11035.0 | 23.184 |
| 11040.0 | 23.166 |
| 11045.0 | 23.149 |
| 11050.0 | 23.131 |
| 11055.0 | 23.113 |
| 11060.0 | 23.095 |
| 11065.0 | 23.077 |
| 11070.0 | 23.06 |
| 11075.0 | 23.042 |
| 11080.0 | 23.024 |
| 11085.0 | 23.006 |
| 11090.0 | 22.989 |
| 11095.0 | 22.971 |
| 11100.0 | 22.953 |
| 11105.0 | 22.936 |
| 11110.0 | 22.918 |
| 11115.0 | 22.9 |
| 11120.0 | 22.883 |
| 11125.0 | 22.865 |
| 11130.0 | 22.847 |
| 11135.0 | 22.83 |
| 11140.0 | 22.812 |
| 11145.0 | 22.795 |
| 11150.0 | 22.777 |
| 11155.0 | 22.759 |
| 11160.0 | 22.742 |
| 11165.0 | 22.724 |
| 11170.0 | 22.707 |
| 11175.0 | 22.689 |
| 11180.0 | 22.672 |
| 11185.0 | 22.654 |
| 11190.0 | 22.637 |
| 11195.0 | 22.62 |
| 11200.0 | 22.602 |
| 11205.0 | 22.585 |
| 11210.0 | 22.567 |
| 11215.0 | 22.55 |
| 11220.0 | 22.533 |
| 11225.0 | 22.515 |
| 11230.0 | 22.498 |
| 11235.0 | 22.481 |
| 11240.0 | 22.463 |
| 11245.0 | 22.446 |
| 11250.0 | 22.429 |
| 11255.0 | 22.411 |
| 11260.0 | 22.394 |
| 11265.0 | 22.377 |
| 11270.0 | 22.36 |
| 11275.0 | 22.342 |
| 11280.0 | 22.325 |
| 11285.0 | 22.308 |
| 11290.0 | 22.291 |
| 11295.0 | 22.274 |
| 11300.0 | 22.256 |
| 11305.0 | 22.239 |
| 11310.0 | 22.222 |
| 11315.0 | 22.205 |
| 11320.0 | 22.188 |
| 11325.0 | 22.171 |
| 11330.0 | 22.154 |
| 11335.0 | 22.137 |
| 11340.0 | 22.12 |
| 11345.0 | 22.103 |
| 11350.0 | 22.086 |
| 11355.0 | 22.069 |
| 11360.0 | 22.052 |
| 11365.0 | 22.035 |
| 11370.0 | 22.018 |
| 11375.0 | 22.001 |
| 11380.0 | 21.984 |
| 11385.0 | 21.967 |
| 11390.0 | 21.95 |
| 11395.0 | 21.933 |
| 11400.0 | 21.916 |
| 11405.0 | 21.899 |
| 11410.0 | 21.882 |
| 11415.0 | 21.865 |
| 11420.0 | 21.849 |
| 11425.0 | 21.832 |
| 11430.0 | 21.815 |
| 11435.0 | 21.798 |
| 11440.0 | 21.781 |
| 11445.0 | 21.765 |
| 11450.0 | 21.748 |
| 11455.0 | 21.731 |
| 11460.0 | 21.714 |
| 11465.0 | 21.698 |
| 11470.0 | 21.681 |
| 11475.0 | 21.664 |
| 11480.0 | 21.647 |
| 11485.0 | 21.631 |
| 11490.0 | 21.614 |
| 11495.0 | 21.597 |
| 11500.0 | 21.581 |
| 11505.0 | 21.564 |
| 11510.0 | 21.548 |
| 11515.0 | 21.531 |
| 11520.0 | 21.514 |
| 11525.0 | 21.498 |
| 11530.0 | 21.481 |
| 11535.0 | 21.465 |
| 11540.0 | 21.448 |
| 11545.0 | 21.432 |
| 11550.0 | 21.415 |
| 11555.0 | 21.399 |
| 11560.0 | 21.382 |
| 11565.0 | 21.366 |
| 11570.0 | 21.349 |
| 11575.0 | 21.333 |
| 11580.0 | 21.316 |
| 11585.0 | 21.3 |
| 11590.0 | 21.284 |
| 11595.0 | 21.267 |
| 11600.0 | 21.251 |
| 11605.0 | 21.234 |
| 11610.0 | 21.218 |
| 11615.0 | 21.202 |
| 11620.0 | 21.185 |
| 11625.0 | 21.169 |
| 11630.0 | 21.153 |
| 11635.0 | 21.136 |
| 11640.0 | 21.12 |
| 11645.0 | 21.104 |
| 11650.0 | 21.088 |
| 11655.0 | 21.071 |
| 11660.0 | 21.055 |
| 11665.0 | 21.039 |
| 11670.0 | 21.023 |
| 11675.0 | 21.006 |
| 11680.0 | 20.99 |
| 11685.0 | 20.974 |
| 11690.0 | 20.958 |
| 11695.0 | 20.942 |
| 11700.0 | 20.926 |
| 11705.0 | 20.91 |
| 11710.0 | 20.893 |
| 11715.0 | 20.877 |
| 11720.0 | 20.861 |
| 11725.0 | 20.845 |
| 11730.0 | 20.829 |
| 11735.0 | 20.813 |
| 11740.0 | 20.797 |
| 11745.0 | 20.781 |
| 11750.0 | 20.765 |
| 11755.0 | 20.749 |
| 11760.0 | 20.733 |
| 11765.0 | 20.717 |
| 11770.0 | 20.701 |
| 11775.0 | 20.685 |
| 11780.0 | 20.669 |
| 11785.0 | 20.653 |
| 11790.0 | 20.637 |
| 11795.0 | 20.622 |
| 11800.0 | 20.606 |
| 11805.0 | 20.59 |
| 11810.0 | 20.574 |
| 11815.0 | 20.558 |
| 11820.0 | 20.542 |
| 11825.0 | 20.526 |
| 11830.0 | 20.511 |
| 11835.0 | 20.495 |
| 11840.0 | 20.479 |
| 11845.0 | 20.463 |
| 11850.0 | 20.447 |
| 11855.0 | 20.432 |
| 11860.0 | 20.416 |
| 11865.0 | 20.4 |
| 11870.0 | 20.385 |
| 11875.0 | 20.369 |
| 11880.0 | 20.353 |
| 11885.0 | 20.337 |
| 11890.0 | 20.322 |
| 11895.0 | 20.306 |
| 11900.0 | 20.29 |
| 11905.0 | 20.275 |
| 11910.0 | 20.259 |
| 11915.0 | 20.244 |
| 11920.0 | 20.228 |
| 11925.0 | 20.212 |
| 11930.0 | 20.197 |
| 11935.0 | 20.181 |
| 11940.0 | 20.166 |
| 11945.0 | 20.15 |
| 11950.0 | 20.135 |
| 11955.0 | 20.119 |
| 11960.0 | 20.104 |
| 11965.0 | 20.088 |
| 11970.0 | 20.073 |
| 11975.0 | 20.057 |
| 11980.0 | 20.042 |
| 11985.0 | 20.026 |
| 11990.0 | 20.011 |
| 11995.0 | 19.996 |
| 12000.0 | 19.98 |
| 12005.0 | 19.965 |
| 12010.0 | 19.949 |
| 12015.0 | 19.934 |
| 12020.0 | 19.919 |
| 12025.0 | 19.903 |
| 12030.0 | 19.888 |
| 12035.0 | 19.873 |
| 12040.0 | 19.857 |
| 12045.0 | 19.842 |
| 12050.0 | 19.827 |
| 12055.0 | 19.811 |
| 12060.0 | 19.796 |
| 12065.0 | 19.781 |
| 12070.0 | 19.766 |
| 12075.0 | 19.75 |
| 12080.0 | 19.735 |
| 12085.0 | 19.72 |
| 12090.0 | 19.705 |
| 12095.0 | 19.69 |
| 12100.0 | 19.675 |
| 12105.0 | 19.659 |
| 12110.0 | 19.644 |
| 12115.0 | 19.629 |
| 12120.0 | 19.614 |
| 12125.0 | 19.599 |
| 12130.0 | 19.584 |
| 12135.0 | 19.569 |
| 12140.0 | 19.554 |
| 12145.0 | 19.539 |
| 12150.0 | 19.523 |
| 12155.0 | 19.508 |
| 12160.0 | 19.493 |
| 12165.0 | 19.478 |
| 12170.0 | 19.463 |
| 12175.0 | 19.448 |
| 12180.0 | 19.433 |
| 12185.0 | 19.418 |
| 12190.0 | 19.404 |
| 12195.0 | 19.389 |
| 12200.0 | 19.374 |
| 12205.0 | 19.359 |
| 12210.0 | 19.344 |
| 12215.0 | 19.329 |
| 12220.0 | 19.314 |
| 12225.0 | 19.299 |
| 12230.0 | 19.284 |
| 12235.0 | 19.269 |
| 12240.0 | 19.255 |
| 12245.0 | 19.24 |
| 12250.0 | 19.225 |
| 12255.0 | 19.21 |
| 12260.0 | 19.195 |
| 12265.0 | 19.18 |
| 12270.0 | 19.166 |
| 12275.0 | 19.151 |
| 12280.0 | 19.136 |
| 12285.0 | 19.121 |
| 12290.0 | 19.107 |
| 12295.0 | 19.092 |
| 12300.0 | 19.077 |
| 12305.0 | 19.063 |
| 12310.0 | 19.048 |
| 12315.0 | 19.033 |
| 12320.0 | 19.019 |
| 12325.0 | 19.004 |
| 12330.0 | 18.989 |
| 12335.0 | 18.975 |
| 12340.0 | 18.96 |
| 12345.0 | 18.945 |
| 12350.0 | 18.931 |
| 12355.0 | 18.916 |
| 12360.0 | 18.902 |
| 12365.0 | 18.887 |
| 12370.0 | 18.873 |
| 12375.0 | 18.858 |
| 12380.0 | 18.844 |
| 12385.0 | 18.829 |
| 12390.0 | 18.814 |
| 12395.0 | 18.8 |
| 12400.0 | 18.786 |
| 12405.0 | 18.771 |
| 12410.0 | 18.757 |
| 12415.0 | 18.742 |
| 12420.0 | 18.728 |
| 12425.0 | 18.713 |
| 12430.0 | 18.699 |
| 12435.0 | 18.684 |
| 12440.0 | 18.67 |
| 12445.0 | 18.656 |
| 12450.0 | 18.641 |
| 12455.0 | 18.627 |
| 12460.0 | 18.613 |
| 12465.0 | 18.598 |
| 12470.0 | 18.584 |
| 12475.0 | 18.57 |
| 12480.0 | 18.555 |
| 12485.0 | 18.541 |
| 12490.0 | 18.527 |
| 12495.0 | 18.512 |
| 12500.0 | 18.498 |
| 12505.0 | 18.484 |
| 12510.0 | 18.47 |
| 12515.0 | 18.455 |
| 12520.0 | 18.441 |
| 12525.0 | 18.427 |
| 12530.0 | 18.413 |
| 12535.0 | 18.399 |
| 12540.0 | 18.384 |
| 12545.0 | 18.37 |
| 12550.0 | 18.356 |
| 12555.0 | 18.342 |
| 12560.0 | 18.328 |
| 12565.0 | 18.314 |
| 12570.0 | 18.3 |
| 12575.0 | 18.286 |
| 12580.0 | 18.271 |
| 12585.0 | 18.257 |
| 12590.0 | 18.243 |
| 12595.0 | 18.229 |
| 12600.0 | 18.215 |
| 12605.0 | 18.201 |
| 12610.0 | 18.187 |
| 12615.0 | 18.173 |
| 12620.0 | 18.159 |
| 12625.0 | 18.145 |
| 12630.0 | 18.131 |
| 12635.0 | 18.117 |
| 12640.0 | 18.103 |
| 12645.0 | 18.089 |
| 12650.0 | 18.075 |
| 12655.0 | 18.061 |
| 12660.0 | 18.048 |
| 12665.0 | 18.034 |
| 12670.0 | 18.02 |
| 12675.0 | 18.006 |
| 12680.0 | 17.992 |
| 12685.0 | 17.978 |
| 12690.0 | 17.964 |
| 12695.0 | 17.95 |
| 12700.0 | 17.937 |
| 12705.0 | 17.923 |
| 12710.0 | 17.909 |
| 12715.0 | 17.895 |
| 12720.0 | 17.881 |
| 12725.0 | 17.868 |
| 12730.0 | 17.854 |
| 12735.0 | 17.84 |
| 12740.0 | 17.826 |
| 12745.0 | 17.813 |
| 12750.0 | 17.799 |
| 12755.0 | 17.785 |
| 12760.0 | 17.772 |
| 12765.0 | 17.758 |
| 12770.0 | 17.744 |
| 12775.0 | 17.731 |
| 12780.0 | 17.717 |
| 12785.0 | 17.703 |
| 12790.0 | 17.69 |
| 12795.0 | 17.676 |
| 12800.0 | 17.662 |
| 12805.0 | 17.649 |
| 12810.0 | 17.635 |
| 12815.0 | 17.622 |
| 12820.0 | 17.608 |
| 12825.0 | 17.594 |
| 12830.0 | 17.581 |
| 12835.0 | 17.567 |
| 12840.0 | 17.554 |
| 12845.0 | 17.54 |
| 12850.0 | 17.527 |
| 12855.0 | 17.513 |
| 12860.0 | 17.5 |
| 12865.0 | 17.486 |
| 12870.0 | 17.473 |
| 12875.0 | 17.459 |
| 12880.0 | 17.446 |
| 12885.0 | 17.432 |
| 12890.0 | 17.419 |
| 12895.0 | 17.406 |
| 12900.0 | 17.392 |
| 12905.0 | 17.379 |
| 12910.0 | 17.365 |
| 12915.0 | 17.352 |
| 12920.0 | 17.339 |
| 12925.0 | 17.325 |
| 12930.0 | 17.312 |
| 12935.0 | 17.299 |
| 12940.0 | 17.285 |
| 12945.0 | 17.272 |
| 12950.0 | 17.259 |
| 12955.0 | 17.245 |
| 12960.0 | 17.232 |
| 12965.0 | 17.219 |
| 12970.0 | 17.206 |
| 12975.0 | 17.192 |
| 12980.0 | 17.179 |
| 12985.0 | 17.166 |
| 12990.0 | 17.153 |
| 12995.0 | 17.139 |
| 13000.0 | 17.126 |
| 13005.0 | 17.113 |
| 13010.0 | 17.1 |
| 13015.0 | 17.087 |
| 13020.0 | 17.073 |
| 13025.0 | 17.06 |
| 13030.0 | 17.047 |
| 13035.0 | 17.034 |
| 13040.0 | 17.021 |
| 13045.0 | 17.008 |
| 13050.0 | 16.995 |
| 13055.0 | 16.982 |
| 13060.0 | 16.969 |
| 13065.0 | 16.955 |
| 13070.0 | 16.942 |
| 13075.0 | 16.929 |
| 13080.0 | 16.916 |
| 13085.0 | 16.903 |
| 13090.0 | 16.89 |
| 13095.0 | 16.877 |
| 13100.0 | 16.864 |
| 13105.0 | 16.851 |
| 13110.0 | 16.838 |
| 13115.0 | 16.825 |
| 13120.0 | 16.812 |
| 13125.0 | 16.799 |
| 13130.0 | 16.786 |
| 13135.0 | 16.773 |
| 13140.0 | 16.761 |
| 13145.0 | 16.748 |
| 13150.0 | 16.735 |
| 13155.0 | 16.722 |
| 13160.0 | 16.709 |
| 13165.0 | 16.696 |
| 13170.0 | 16.683 |
| 13175.0 | 16.67 |
| 13180.0 | 16.658 |
| 13185.0 | 16.645 |
| 13190.0 | 16.632 |
| 13195.0 | 16.619 |
| 13200.0 | 16.606 |
| 13205.0 | 16.593 |
| 13210.0 | 16.581 |
| 13215.0 | 16.568 |
| 13220.0 | 16.555 |
| 13225.0 | 16.542 |
| 13230.0 | 16.53 |
| 13235.0 | 16.517 |
| 13240.0 | 16.504 |
| 13245.0 | 16.491 |
| 13250.0 | 16.479 |
| 13255.0 | 16.466 |
| 13260.0 | 16.453 |
| 13265.0 | 16.441 |
| 13270.0 | 16.428 |
| 13275.0 | 16.415 |
| 13280.0 | 16.403 |
| 13285.0 | 16.39 |
| 13290.0 | 16.378 |
| 13295.0 | 16.365 |
| 13300.0 | 16.352 |
| 13305.0 | 16.34 |
| 13310.0 | 16.327 |
| 13315.0 | 16.315 |
| 13320.0 | 16.302 |
| 13325.0 | 16.289 |
| 13330.0 | 16.277 |
| 13335.0 | 16.264 |
| 13340.0 | 16.252 |
| 13345.0 | 16.239 |
| 13350.0 | 16.227 |
| 13355.0 | 16.214 |
| 13360.0 | 16.202 |
| 13365.0 | 16.189 |
| 13370.0 | 16.177 |
| 13375.0 | 16.164 |
| 13380.0 | 16.152 |
| 13385.0 | 16.139 |
| 13390.0 | 16.127 |
| 13395.0 | 16.115 |
| 13400.0 | 16.102 |
| 13405.0 | 16.09 |
| 13410.0 | 16.077 |
| 13415.0 | 16.065 |
| 13420.0 | 16.053 |
| 13425.0 | 16.04 |
| 13430.0 | 16.028 |
| 13435.0 | 16.016 |
| 13440.0 | 16.003 |
| 13445.0 | 15.991 |
| 13450.0 | 15.979 |
| 13455.0 | 15.966 |
| 13460.0 | 15.954 |
| 13465.0 | 15.942 |
| 13470.0 | 15.929 |
| 13475.0 | 15.917 |
| 13480.0 | 15.905 |
| 13485.0 | 15.893 |
| 13490.0 | 15.88 |
| 13495.0 | 15.868 |
| 13500.0 | 15.856 |
| 13505.0 | 15.844 |
| 13510.0 | 15.831 |
| 13515.0 | 15.819 |
| 13520.0 | 15.807 |
| 13525.0 | 15.795 |
| 13530.0 | 15.783 |
| 13535.0 | 15.771 |
| 13540.0 | 15.758 |
| 13545.0 | 15.746 |
| 13550.0 | 15.734 |
| 13555.0 | 15.722 |
| 13560.0 | 15.71 |
| 13565.0 | 15.698 |
| 13570.0 | 15.686 |
| 13575.0 | 15.674 |
| 13580.0 | 15.662 |
| 13585.0 | 15.65 |
| 13590.0 | 15.637 |
| 13595.0 | 15.625 |
| 13600.0 | 15.613 |
| 13605.0 | 15.601 |
| 13610.0 | 15.589 |
| 13615.0 | 15.577 |
| 13620.0 | 15.565 |
| 13625.0 | 15.553 |
| 13630.0 | 15.541 |
| 13635.0 | 15.529 |
| 13640.0 | 15.517 |
| 13645.0 | 15.505 |
| 13650.0 | 15.494 |
| 13655.0 | 15.482 |
| 13660.0 | 15.47 |
| 13665.0 | 15.458 |
| 13670.0 | 15.446 |
| 13675.0 | 15.434 |
| 13680.0 | 15.422 |
| 13685.0 | 15.41 |
| 13690.0 | 15.398 |
| 13695.0 | 15.386 |
| 13700.0 | 15.375 |
| 13705.0 | 15.363 |
| 13710.0 | 15.351 |
| 13715.0 | 15.339 |
| 13720.0 | 15.327 |
| 13725.0 | 15.315 |
| 13730.0 | 15.304 |
| 13735.0 | 15.292 |
| 13740.0 | 15.28 |
| 13745.0 | 15.268 |
| 13750.0 | 15.257 |
| 13755.0 | 15.245 |
| 13760.0 | 15.233 |
| 13765.0 | 15.221 |
| 13770.0 | 15.21 |
| 13775.0 | 15.198 |
| 13780.0 | 15.186 |
| 13785.0 | 15.174 |
| 13790.0 | 15.163 |
| 13795.0 | 15.151 |
| 13800.0 | 15.139 |
| 13805.0 | 15.128 |
| 13810.0 | 15.116 |
| 13815.0 | 15.104 |
| 13820.0 | 15.093 |
| 13825.0 | 15.081 |
| 13830.0 | 15.07 |
| 13835.0 | 15.058 |
| 13840.0 | 15.046 |
| 13845.0 | 15.035 |
| 13850.0 | 15.023 |
| 13855.0 | 15.012 |
| 13860.0 | 15 |
| 13865.0 | 14.989 |
| 13870.0 | 14.977 |
| 13875.0 | 14.965 |
| 13880.0 | 14.954 |
| 13885.0 | 14.942 |
| 13890.0 | 14.931 |
| 13895.0 | 14.919 |
| 13900.0 | 14.908 |
| 13905.0 | 14.896 |
| 13910.0 | 14.885 |
| 13915.0 | 14.873 |
| 13920.0 | 14.862 |
| 13925.0 | 14.851 |
| 13930.0 | 14.839 |
| 13935.0 | 14.828 |
| 13940.0 | 14.816 |
| 13945.0 | 14.805 |
| 13950.0 | 14.793 |
| 13955.0 | 14.782 |
| 13960.0 | 14.771 |
| 13965.0 | 14.759 |
| 13970.0 | 14.748 |
| 13975.0 | 14.737 |
| 13980.0 | 14.725 |
| 13985.0 | 14.714 |
| 13990.0 | 14.702 |
| 13995.0 | 14.691 |
| 14000.0 | 14.68 |
| 14005.0 | 14.669 |
| 14010.0 | 14.657 |
| 14015.0 | 14.646 |
| 14020.0 | 14.635 |
| 14025.0 | 14.623 |
| 14030.0 | 14.612 |
| 14035.0 | 14.601 |
| 14040.0 | 14.59 |
| 14045.0 | 14.578 |
| 14050.0 | 14.567 |
| 14055.0 | 14.556 |
| 14060.0 | 14.545 |
| 14065.0 | 14.534 |
| 14070.0 | 14.522 |
| 14075.0 | 14.511 |
| 14080.0 | 14.5 |
| 14085.0 | 14.489 |
| 14090.0 | 14.478 |
| 14095.0 | 14.466 |
| 14100.0 | 14.455 |
| 14105.0 | 14.444 |
| 14110.0 | 14.433 |
| 14115.0 | 14.422 |
| 14120.0 | 14.411 |
| 14125.0 | 14.4 |
| 14130.0 | 14.389 |
| 14135.0 | 14.378 |
| 14140.0 | 14.366 |
| 14145.0 | 14.355 |
| 14150.0 | 14.344 |
| 14155.0 | 14.333 |
| 14160.0 | 14.322 |
| 14165.0 | 14.311 |
| 14170.0 | 14.3 |
| 14175.0 | 14.289 |
| 14180.0 | 14.278 |
| 14185.0 | 14.267 |
| 14190.0 | 14.256 |
| 14195.0 | 14.245 |
| 14200.0 | 14.234 |
| 14205.0 | 14.223 |
| 14210.0 | 14.212 |
| 14215.0 | 14.201 |
| 14220.0 | 14.19 |
| 14225.0 | 14.179 |
| 14230.0 | 14.169 |
| 14235.0 | 14.158 |
| 14240.0 | 14.147 |
| 14245.0 | 14.136 |
| 14250.0 | 14.125 |
| 14255.0 | 14.114 |
| 14260.0 | 14.103 |
| 14265.0 | 14.092 |
| 14270.0 | 14.081 |
| 14275.0 | 14.071 |
| 14280.0 | 14.06 |
| 14285.0 | 14.049 |
| 14290.0 | 14.038 |
| 14295.0 | 14.027 |
| 14300.0 | 14.017 |
| 14305.0 | 14.006 |
| 14310.0 | 13.995 |
| 14315.0 | 13.984 |
| 14320.0 | 13.973 |
| 14325.0 | 13.963 |
| 14330.0 | 13.952 |
| 14335.0 | 13.941 |
| 14340.0 | 13.93 |
| 14345.0 | 13.92 |
| 14350.0 | 13.909 |
| 14355.0 | 13.898 |
| 14360.0 | 13.887 |
| 14365.0 | 13.877 |
| 14370.0 | 13.866 |
| 14375.0 | 13.855 |
| 14380.0 | 13.845 |
| 14385.0 | 13.834 |
| 14390.0 | 13.823 |
| 14395.0 | 13.813 |
| 14400.0 | 13.802 |
| 14405.0 | 13.792 |
| 14410.0 | 13.781 |
| 14415.0 | 13.77 |
| 14420.0 | 13.76 |
| 14425.0 | 13.749 |
| 14430.0 | 13.738 |
| 14435.0 | 13.728 |
| 14440.0 | 13.717 |
| 14445.0 | 13.707 |
| 14450.0 | 13.696 |
| 14455.0 | 13.686 |
| 14460.0 | 13.675 |
| 14465.0 | 13.665 |
| 14470.0 | 13.654 |
| 14475.0 | 13.644 |
| 14480.0 | 13.633 |
| 14485.0 | 13.622 |
| 14490.0 | 13.612 |
| 14495.0 | 13.602 |
| 14500.0 | 13.591 |
| 14505.0 | 13.581 |
| 14510.0 | 13.57 |
| 14515.0 | 13.56 |
| 14520.0 | 13.549 |
| 14525.0 | 13.539 |
| 14530.0 | 13.528 |
| 14535.0 | 13.518 |
| 14540.0 | 13.508 |
| 14545.0 | 13.497 |
| 14550.0 | 13.487 |
| 14555.0 | 13.476 |
| 14560.0 | 13.466 |
| 14565.0 | 13.456 |
| 14570.0 | 13.445 |
| 14575.0 | 13.435 |
| 14580.0 | 13.424 |
| 14585.0 | 13.414 |
| 14590.0 | 13.404 |
| 14595.0 | 13.393 |
| 14600.0 | 13.383 |
| 14605.0 | 13.373 |
| 14610.0 | 13.363 |
| 14615.0 | 13.352 |
| 14620.0 | 13.342 |
| 14625.0 | 13.332 |
| 14630.0 | 13.321 |
| 14635.0 | 13.311 |
| 14640.0 | 13.301 |
| 14645.0 | 13.291 |
| 14650.0 | 13.28 |
| 14655.0 | 13.27 |
| 14660.0 | 13.26 |
| 14665.0 | 13.25 |
| 14670.0 | 13.24 |
| 14675.0 | 13.229 |
| 14680.0 | 13.219 |
| 14685.0 | 13.209 |
| 14690.0 | 13.199 |
| 14695.0 | 13.189 |
| 14700.0 | 13.178 |
| 14705.0 | 13.168 |
| 14710.0 | 13.158 |
| 14715.0 | 13.148 |
| 14720.0 | 13.138 |
| 14725.0 | 13.128 |
| 14730.0 | 13.118 |
| 14735.0 | 13.108 |
| 14740.0 | 13.097 |
| 14745.0 | 13.087 |
| 14750.0 | 13.077 |
| 14755.0 | 13.067 |
| 14760.0 | 13.057 |
| 14765.0 | 13.047 |
| 14770.0 | 13.037 |
| 14775.0 | 13.027 |
| 14780.0 | 13.017 |
| 14785.0 | 13.007 |
| 14790.0 | 12.997 |
| 14795.0 | 12.987 |
| 14800.0 | 12.977 |
| 14805.0 | 12.967 |
| 14810.0 | 12.957 |
| 14815.0 | 12.947 |
| 14820.0 | 12.937 |
| 14825.0 | 12.927 |
| 14830.0 | 12.917 |
| 14835.0 | 12.907 |
| 14840.0 | 12.897 |
| 14845.0 | 12.887 |
| 14850.0 | 12.877 |
| 14855.0 | 12.867 |
| 14860.0 | 12.857 |
| 14865.0 | 12.848 |
| 14870.0 | 12.838 |
| 14875.0 | 12.828 |
| 14880.0 | 12.818 |
| 14885.0 | 12.808 |
| 14890.0 | 12.798 |
| 14895.0 | 12.788 |
| 14900.0 | 12.778 |
| 14905.0 | 12.769 |
| 14910.0 | 12.759 |
| 14915.0 | 12.749 |
| 14920.0 | 12.739 |
| 14925.0 | 12.729 |
| 14930.0 | 12.719 |
| 14935.0 | 12.71 |
| 14940.0 | 12.7 |
| 14945.0 | 12.69 |
| 14950.0 | 12.68 |
| 14955.0 | 12.671 |
| 14960.0 | 12.661 |
| 14965.0 | 12.651 |
| 14970.0 | 12.641 |
| 14975.0 | 12.632 |
| 14980.0 | 12.622 |
| 14985.0 | 12.612 |
| 14990.0 | 12.602 |
| 14995.0 | 12.593 |
| 15000.0 | 12.583 |
| 15005.0 | 12.573 |
| 15010.0 | 12.564 |
| 15015.0 | 12.554 |
| 15020.0 | 12.544 |
| 15025.0 | 12.535 |
| 15030.0 | 12.525 |
| 15035.0 | 12.515 |
| 15040.0 | 12.506 |
| 15045.0 | 12.496 |
| 15050.0 | 12.486 |
| 15055.0 | 12.477 |
| 15060.0 | 12.467 |
| 15065.0 | 12.458 |
| 15070.0 | 12.448 |
| 15075.0 | 12.438 |
| 15080.0 | 12.429 |
| 15085.0 | 12.419 |
| 15090.0 | 12.41 |
| 15095.0 | 12.4 |
| 15100.0 | 12.391 |
| 15105.0 | 12.381 |
| 15110.0 | 12.371 |
| 15115.0 | 12.362 |
| 15120.0 | 12.352 |
| 15125.0 | 12.343 |
| 15130.0 | 12.333 |
| 15135.0 | 12.324 |
| 15140.0 | 12.314 |
| 15145.0 | 12.305 |
| 15150.0 | 12.295 |
| 15155.0 | 12.286 |
| 15160.0 | 12.276 |
| 15165.0 | 12.267 |
| 15170.0 | 12.258 |
| 15175.0 | 12.248 |
| 15180.0 | 12.239 |
| 15185.0 | 12.229 |
| 15190.0 | 12.22 |
| 15195.0 | 12.21 |
| 15200.0 | 12.201 |
| 15205.0 | 12.192 |
| 15210.0 | 12.182 |
| 15215.0 | 12.173 |
| 15220.0 | 12.163 |
| 15225.0 | 12.154 |
| 15230.0 | 12.145 |
| 15235.0 | 12.135 |
| 15240.0 | 12.126 |
| 15245.0 | 12.117 |
| 15250.0 | 12.107 |
| 15255.0 | 12.098 |
| 15260.0 | 12.089 |
| 15265.0 | 12.079 |
| 15270.0 | 12.07 |
| 15275.0 | 12.061 |
| 15280.0 | 12.051 |
| 15285.0 | 12.042 |
| 15290.0 | 12.033 |
| 15295.0 | 12.024 |
| 15300.0 | 12.014 |
| 15305.0 | 12.005 |
| 15310.0 | 11.996 |
| 15315.0 | 11.987 |
| 15320.0 | 11.977 |
| 15325.0 | 11.968 |
| 15330.0 | 11.959 |
| 15335.0 | 11.95 |
| 15340.0 | 11.941 |
| 15345.0 | 11.931 |
| 15350.0 | 11.922 |
| 15355.0 | 11.913 |
| 15360.0 | 11.904 |
| 15365.0 | 11.895 |
| 15370.0 | 11.885 |
| 15375.0 | 11.876 |
| 15380.0 | 11.867 |
| 15385.0 | 11.858 |
| 15390.0 | 11.849 |
| 15395.0 | 11.84 |
| 15400.0 | 11.831 |
| 15405.0 | 11.822 |
| 15410.0 | 11.812 |
| 15415.0 | 11.803 |
| 15420.0 | 11.794 |
| 15425.0 | 11.785 |
| 15430.0 | 11.776 |
| 15435.0 | 11.767 |
| 15440.0 | 11.758 |
| 15445.0 | 11.749 |
| 15450.0 | 11.74 |
| 15455.0 | 11.731 |
| 15460.0 | 11.722 |
| 15465.0 | 11.713 |
| 15470.0 | 11.704 |
| 15475.0 | 11.695 |
| 15480.0 | 11.686 |
| 15485.0 | 11.677 |
| 15490.0 | 11.668 |
| 15495.0 | 11.659 |
| 15500.0 | 11.65 |
| 15505.0 | 11.641 |
| 15510.0 | 11.632 |
| 15515.0 | 11.623 |
| 15520.0 | 11.614 |
| 15525.0 | 11.605 |
| 15530.0 | 11.596 |
| 15535.0 | 11.587 |
| 15540.0 | 11.578 |
| 15545.0 | 11.569 |
| 15550.0 | 11.56 |
| 15555.0 | 11.551 |
| 15560.0 | 11.542 |
| 15565.0 | 11.534 |
| 15570.0 | 11.525 |
| 15575.0 | 11.516 |
| 15580.0 | 11.507 |
| 15585.0 | 11.498 |
| 15590.0 | 11.489 |
| 15595.0 | 11.48 |
| 15600.0 | 11.472 |
| 15605.0 | 11.463 |
| 15610.0 | 11.454 |
| 15615.0 | 11.445 |
| 15620.0 | 11.436 |
| 15625.0 | 11.427 |
| 15630.0 | 11.419 |
| 15635.0 | 11.41 |
| 15640.0 | 11.401 |
| 15645.0 | 11.392 |
| 15650.0 | 11.383 |
| 15655.0 | 11.375 |
| 15660.0 | 11.366 |
| 15665.0 | 11.357 |
| 15670.0 | 11.348 |
| 15675.0 | 11.34 |
| 15680.0 | 11.331 |
| 15685.0 | 11.322 |
| 15690.0 | 11.313 |
| 15695.0 | 11.305 |
| 15700.0 | 11.296 |
| 15705.0 | 11.287 |
| 15710.0 | 11.279 |
| 15715.0 | 11.27 |
| 15720.0 | 11.261 |
| 15725.0 | 11.253 |
| 15730.0 | 11.244 |
| 15735.0 | 11.235 |
| 15740.0 | 11.227 |
| 15745.0 | 11.218 |
| 15750.0 | 11.209 |
| 15755.0 | 11.201 |
| 15760.0 | 11.192 |
| 15765.0 | 11.183 |
| 15770.0 | 11.175 |
| 15775.0 | 11.166 |
| 15780.0 | 11.158 |
| 15785.0 | 11.149 |
| 15790.0 | 11.14 |
| 15795.0 | 11.132 |
| 15800.0 | 11.123 |
| 15805.0 | 11.115 |
| 15810.0 | 11.106 |
| 15815.0 | 11.098 |
| 15820.0 | 11.089 |
| 15825.0 | 11.08 |
| 15830.0 | 11.072 |
| 15835.0 | 11.063 |
| 15840.0 | 11.055 |
| 15845.0 | 11.046 |
| 15850.0 | 11.038 |
| 15855.0 | 11.029 |
| 15860.0 | 11.021 |
| 15865.0 | 11.012 |
| 15870.0 | 11.004 |
| 15875.0 | 10.995 |
| 15880.0 | 10.987 |
| 15885.0 | 10.978 |
| 15890.0 | 10.97 |
| 15895.0 | 10.962 |
| 15900.0 | 10.953 |
| 15905.0 | 10.945 |
| 15910.0 | 10.936 |
| 15915.0 | 10.928 |
| 15920.0 | 10.919 |
| 15925.0 | 10.911 |
| 15930.0 | 10.903 |
| 15935.0 | 10.894 |
| 15940.0 | 10.886 |
| 15945.0 | 10.877 |
| 15950.0 | 10.869 |
| 15955.0 | 10.861 |
| 15960.0 | 10.852 |
| 15965.0 | 10.844 |
| 15970.0 | 10.836 |
| 15975.0 | 10.827 |
| 15980.0 | 10.819 |
| 15985.0 | 10.811 |
| 15990.0 | 10.802 |
| 15995.0 | 10.794 |
| 16000.0 | 10.786 |
| 16005.0 | 10.777 |
| 16010.0 | 10.769 |
| 16015.0 | 10.761 |
| 16020.0 | 10.752 |
| 16025.0 | 10.744 |
| 16030.0 | 10.736 |
| 16035.0 | 10.728 |
| 16040.0 | 10.719 |
| 16045.0 | 10.711 |
| 16050.0 | 10.703 |
| 16055.0 | 10.695 |
| 16060.0 | 10.686 |
| 16065.0 | 10.678 |
| 16070.0 | 10.67 |
| 16075.0 | 10.662 |
| 16080.0 | 10.653 |
| 16085.0 | 10.645 |
| 16090.0 | 10.637 |
| 16095.0 | 10.629 |
| 16100.0 | 10.621 |
| 16105.0 | 10.612 |
| 16110.0 | 10.604 |
| 16115.0 | 10.596 |
| 16120.0 | 10.588 |
| 16125.0 | 10.58 |
| 16130.0 | 10.572 |
| 16135.0 | 10.564 |
| 16140.0 | 10.555 |
| 16145.0 | 10.547 |
| 16150.0 | 10.539 |
| 16155.0 | 10.531 |
| 16160.0 | 10.523 |
| 16165.0 | 10.515 |
| 16170.0 | 10.507 |
| 16175.0 | 10.499 |
| 16180.0 | 10.49 |
| 16185.0 | 10.482 |
| 16190.0 | 10.474 |
| 16195.0 | 10.466 |
| 16200.0 | 10.458 |
| 16205.0 | 10.45 |
| 16210.0 | 10.442 |
| 16215.0 | 10.434 |
| 16220.0 | 10.426 |
| 16225.0 | 10.418 |
| 16230.0 | 10.41 |
| 16235.0 | 10.402 |
| 16240.0 | 10.394 |
| 16245.0 | 10.386 |
| 16250.0 | 10.378 |
| 16255.0 | 10.37 |
| 16260.0 | 10.362 |
| 16265.0 | 10.354 |
| 16270.0 | 10.346 |
| 16275.0 | 10.338 |
| 16280.0 | 10.33 |
| 16285.0 | 10.322 |
| 16290.0 | 10.314 |
| 16295.0 | 10.306 |
| 16300.0 | 10.298 |
| 16305.0 | 10.29 |
| 16310.0 | 10.282 |
| 16315.0 | 10.274 |
| 16320.0 | 10.267 |
| 16325.0 | 10.259 |
| 16330.0 | 10.251 |
| 16335.0 | 10.243 |
| 16340.0 | 10.235 |
| 16345.0 | 10.227 |
| 16350.0 | 10.219 |
| 16355.0 | 10.211 |
| 16360.0 | 10.203 |
| 16365.0 | 10.196 |
| 16370.0 | 10.188 |
| 16375.0 | 10.18 |
| 16380.0 | 10.172 |
| 16385.0 | 10.164 |
| 16390.0 | 10.156 |
| 16395.0 | 10.149 |
| 16400.0 | 10.141 |
| 16405.0 | 10.133 |
| 16410.0 | 10.125 |
| 16415.0 | 10.117 |
| 16420.0 | 10.11 |
| 16425.0 | 10.102 |
| 16430.0 | 10.094 |
| 16435.0 | 10.086 |
| 16440.0 | 10.078 |
| 16445.0 | 10.071 |
| 16450.0 | 10.063 |
| 16455.0 | 10.055 |
| 16460.0 | 10.047 |
| 16465.0 | 10.04 |
| 16470.0 | 10.032 |
| 16475.0 | 10.024 |
| 16480.0 | 10.016 |
| 16485.0 | 10.009 |
| 16490.0 | 10.001 |
| 16495.0 | 9.993 |
| 16500.0 | 9.986 |
| 16505.0 | 9.978 |
| 16510.0 | 9.97 |
| 16515.0 | 9.963 |
| 16520.0 | 9.955 |
| 16525.0 | 9.947 |
| 16530.0 | 9.94 |
| 16535.0 | 9.932 |
| 16540.0 | 9.924 |
| 16545.0 | 9.917 |
| 16550.0 | 9.909 |
| 16555.0 | 9.901 |
| 16560.0 | 9.894 |
| 16565.0 | 9.886 |
| 16570.0 | 9.878 |
| 16575.0 | 9.871 |
| 16580.0 | 9.863 |
| 16585.0 | 9.856 |
| 16590.0 | 9.848 |
| 16595.0 | 9.84 |
| 16600.0 | 9.833 |
| 16605.0 | 9.825 |
| 16610.0 | 9.818 |
| 16615.0 | 9.81 |
| 16620.0 | 9.803 |
| 16625.0 | 9.795 |
| 16630.0 | 9.788 |
| 16635.0 | 9.78 |
| 16640.0 | 9.772 |
| 16645.0 | 9.765 |
| 16650.0 | 9.757 |
| 16655.0 | 9.75 |
| 16660.0 | 9.742 |
| 16665.0 | 9.735 |
| 16670.0 | 9.727 |
| 16675.0 | 9.72 |
| 16680.0 | 9.712 |
| 16685.0 | 9.705 |
| 16690.0 | 9.697 |
| 16695.0 | 9.69 |
| 16700.0 | 9.683 |
| 16705.0 | 9.675 |
| 16710.0 | 9.668 |
| 16715.0 | 9.66 |
| 16720.0 | 9.653 |
| 16725.0 | 9.645 |
| 16730.0 | 9.638 |
| 16735.0 | 9.63 |
| 16740.0 | 9.623 |
| 16745.0 | 9.616 |
| 16750.0 | 9.608 |
| 16755.0 | 9.601 |
| 16760.0 | 9.593 |
| 16765.0 | 9.586 |
| 16770.0 | 9.579 |
| 16775.0 | 9.571 |
| 16780.0 | 9.564 |
| 16785.0 | 9.556 |
| 16790.0 | 9.549 |
| 16795.0 | 9.542 |
| 16800.0 | 9.534 |
| 16805.0 | 9.527 |
| 16810.0 | 9.52 |
| 16815.0 | 9.512 |
| 16820.0 | 9.505 |
| 16825.0 | 9.498 |
| 16830.0 | 9.49 |
| 16835.0 | 9.483 |
| 16840.0 | 9.476 |
| 16845.0 | 9.469 |
| 16850.0 | 9.461 |
| 16855.0 | 9.454 |
| 16860.0 | 9.447 |
| 16865.0 | 9.439 |
| 16870.0 | 9.432 |
| 16875.0 | 9.425 |
| 16880.0 | 9.418 |
| 16885.0 | 9.41 |
| 16890.0 | 9.403 |
| 16895.0 | 9.396 |
| 16900.0 | 9.389 |
| 16905.0 | 9.381 |
| 16910.0 | 9.374 |
| 16915.0 | 9.367 |
| 16920.0 | 9.36 |
| 16925.0 | 9.352 |
| 16930.0 | 9.345 |
| 16935.0 | 9.338 |
| 16940.0 | 9.331 |
| 16945.0 | 9.324 |
| 16950.0 | 9.317 |
| 16955.0 | 9.309 |
| 16960.0 | 9.302 |
| 16965.0 | 9.295 |
| 16970.0 | 9.288 |
| 16975.0 | 9.281 |
| 16980.0 | 9.274 |
| 16985.0 | 9.266 |
| 16990.0 | 9.259 |
| 16995.0 | 9.252 |
| 17000.0 | 9.245 |
| 17005.0 | 9.238 |
| 17010.0 | 9.231 |
| 17015.0 | 9.224 |
| 17020.0 | 9.217 |
| 17025.0 | 9.209 |
| 17030.0 | 9.202 |
| 17035.0 | 9.195 |
| 17040.0 | 9.188 |
| 17045.0 | 9.181 |
| 17050.0 | 9.174 |
| 17055.0 | 9.167 |
| 17060.0 | 9.16 |
| 17065.0 | 9.153 |
| 17070.0 | 9.146 |
| 17075.0 | 9.139 |
| 17080.0 | 9.132 |
| 17085.0 | 9.125 |
| 17090.0 | 9.118 |
| 17095.0 | 9.111 |
| 17100.0 | 9.104 |
| 17105.0 | 9.097 |
| 17110.0 | 9.09 |
| 17115.0 | 9.083 |
| 17120.0 | 9.076 |
| 17125.0 | 9.069 |
| 17130.0 | 9.062 |
| 17135.0 | 9.055 |
| 17140.0 | 9.048 |
| 17145.0 | 9.041 |
| 17150.0 | 9.034 |
| 17155.0 | 9.027 |
| 17160.0 | 9.02 |
| 17165.0 | 9.013 |
| 17170.0 | 9.006 |
| 17175.0 | 8.999 |
| 17180.0 | 8.992 |
| 17185.0 | 8.985 |
| 17190.0 | 8.978 |
| 17195.0 | 8.971 |
| 17200.0 | 8.964 |
| 17205.0 | 8.957 |
| 17210.0 | 8.951 |
| 17215.0 | 8.944 |
| 17220.0 | 8.937 |
| 17225.0 | 8.93 |
| 17230.0 | 8.923 |
| 17235.0 | 8.916 |
| 17240.0 | 8.909 |
| 17245.0 | 8.902 |
| 17250.0 | 8.896 |
| 17255.0 | 8.889 |
| 17260.0 | 8.882 |
| 17265.0 | 8.875 |
| 17270.0 | 8.868 |
| 17275.0 | 8.861 |
| 17280.0 | 8.854 |
| 17285.0 | 8.848 |
| 17290.0 | 8.841 |
| 17295.0 | 8.834 |
| 17300.0 | 8.827 |
| 17305.0 | 8.82 |
| 17310.0 | 8.814 |
| 17315.0 | 8.807 |
| 17320.0 | 8.8 |
| 17325.0 | 8.793 |
| 17330.0 | 8.787 |
| 17335.0 | 8.78 |
| 17340.0 | 8.773 |
| 17345.0 | 8.766 |
| 17350.0 | 8.759 |
| 17355.0 | 8.753 |
| 17360.0 | 8.746 |
| 17365.0 | 8.739 |
| 17370.0 | 8.733 |
| 17375.0 | 8.726 |
| 17380.0 | 8.719 |
| 17385.0 | 8.712 |
| 17390.0 | 8.706 |
| 17395.0 | 8.699 |
| 17400.0 | 8.692 |
| 17405.0 | 8.686 |
| 17410.0 | 8.679 |
| 17415.0 | 8.672 |
| 17420.0 | 8.665 |
| 17425.0 | 8.659 |
| 17430.0 | 8.652 |
| 17435.0 | 8.645 |
| 17440.0 | 8.639 |
| 17445.0 | 8.632 |
| 17450.0 | 8.626 |
| 17455.0 | 8.619 |
| 17460.0 | 8.612 |
| 17465.0 | 8.606 |
| 17470.0 | 8.599 |
| 17475.0 | 8.592 |
| 17480.0 | 8.586 |
| 17485.0 | 8.579 |
| 17490.0 | 8.572 |
| 17495.0 | 8.566 |
| 17500.0 | 8.559 |
| 17505.0 | 8.553 |
| 17510.0 | 8.546 |
| 17515.0 | 8.54 |
| 17520.0 | 8.533 |
| 17525.0 | 8.526 |
| 17530.0 | 8.52 |
| 17535.0 | 8.513 |
| 17540.0 | 8.507 |
| 17545.0 | 8.5 |
| 17550.0 | 8.494 |
| 17555.0 | 8.487 |
| 17560.0 | 8.48 |
| 17565.0 | 8.474 |
| 17570.0 | 8.467 |
| 17575.0 | 8.461 |
| 17580.0 | 8.454 |
| 17585.0 | 8.448 |
| 17590.0 | 8.441 |
| 17595.0 | 8.435 |
| 17600.0 | 8.428 |
| 17605.0 | 8.422 |
| 17610.0 | 8.415 |
| 17615.0 | 8.409 |
| 17620.0 | 8.402 |
| 17625.0 | 8.396 |
| 17630.0 | 8.389 |
| 17635.0 | 8.383 |
| 17640.0 | 8.377 |
| 17645.0 | 8.37 |
| 17650.0 | 8.364 |
| 17655.0 | 8.357 |
| 17660.0 | 8.351 |
| 17665.0 | 8.344 |
| 17670.0 | 8.338 |
| 17675.0 | 8.332 |
| 17680.0 | 8.325 |
| 17685.0 | 8.319 |
| 17690.0 | 8.312 |
| 17695.0 | 8.306 |
| 17700.0 | 8.299 |
| 17705.0 | 8.293 |
| 17710.0 | 8.287 |
| 17715.0 | 8.28 |
| 17720.0 | 8.274 |
| 17725.0 | 8.268 |
| 17730.0 | 8.261 |
| 17735.0 | 8.255 |
| 17740.0 | 8.248 |
| 17745.0 | 8.242 |
| 17750.0 | 8.236 |
| 17755.0 | 8.229 |
| 17760.0 | 8.223 |
| 17765.0 | 8.217 |
| 17770.0 | 8.21 |
| 17775.0 | 8.204 |
| 17780.0 | 8.198 |
| 17785.0 | 8.191 |
| 17790.0 | 8.185 |
| 17795.0 | 8.179 |
| 17800.0 | 8.173 |
| 17805.0 | 8.166 |
| 17810.0 | 8.16 |
| 17815.0 | 8.154 |
| 17820.0 | 8.147 |
| 17825.0 | 8.141 |
| 17830.0 | 8.135 |
| 17835.0 | 8.129 |
| 17840.0 | 8.122 |
| 17845.0 | 8.116 |
| 17850.0 | 8.11 |
| 17855.0 | 8.104 |
| 17860.0 | 8.097 |
| 17865.0 | 8.091 |
| 17870.0 | 8.085 |
| 17875.0 | 8.079 |
| 17880.0 | 8.072 |
| 17885.0 | 8.066 |
| 17890.0 | 8.06 |
| 17895.0 | 8.054 |
| 17900.0 | 8.048 |
| 17905.0 | 8.041 |
| 17910.0 | 8.035 |
| 17915.0 | 8.029 |
| 17920.0 | 8.023 |
| 17925.0 | 8.017 |
| 17930.0 | 8.01 |
| 17935.0 | 8.004 |
| 17940.0 | 7.998 |
| 17945.0 | 7.992 |
| 17950.0 | 7.986 |
| 17955.0 | 7.98 |
| 17960.0 | 7.973 |
| 17965.0 | 7.967 |
| 17970.0 | 7.961 |
| 17975.0 | 7.955 |
| 17980.0 | 7.949 |
| 17985.0 | 7.943 |
| 17990.0 | 7.937 |
| 17995.0 | 7.931 |
| 18000.0 | 7.924 |
| 18005.0 | 7.918 |
| 18010.0 | 7.912 |
| 18015.0 | 7.906 |
| 18020.0 | 7.9 |
| 18025.0 | 7.894 |
| 18030.0 | 7.888 |
| 18035.0 | 7.882 |
| 18040.0 | 7.876 |
| 18045.0 | 7.87 |
| 18050.0 | 7.864 |
| 18055.0 | 7.858 |
| 18060.0 | 7.851 |
| 18065.0 | 7.845 |
| 18070.0 | 7.839 |
| 18075.0 | 7.833 |
| 18080.0 | 7.827 |
| 18085.0 | 7.821 |
| 18090.0 | 7.815 |
| 18095.0 | 7.809 |
| 18100.0 | 7.803 |
| 18105.0 | 7.797 |
| 18110.0 | 7.791 |
| 18115.0 | 7.785 |
| 18120.0 | 7.779 |
| 18125.0 | 7.773 |
| 18130.0 | 7.767 |
| 18135.0 | 7.761 |
| 18140.0 | 7.755 |
| 18145.0 | 7.749 |
| 18150.0 | 7.743 |
| 18155.0 | 7.737 |
| 18160.0 | 7.731 |
| 18165.0 | 7.725 |
| 18170.0 | 7.719 |
| 18175.0 | 7.714 |
| 18180.0 | 7.708 |
| 18185.0 | 7.702 |
| 18190.0 | 7.696 |
| 18195.0 | 7.69 |
| 18200.0 | 7.684 |
| 18205.0 | 7.678 |
| 18210.0 | 7.672 |
| 18215.0 | 7.666 |
| 18220.0 | 7.66 |
| 18225.0 | 7.654 |
| 18230.0 | 7.648 |
| 18235.0 | 7.643 |
| 18240.0 | 7.637 |
| 18245.0 | 7.631 |
| 18250.0 | 7.625 |
| 18255.0 | 7.619 |
| 18260.0 | 7.613 |
| 18265.0 | 7.607 |
| 18270.0 | 7.601 |
| 18275.0 | 7.596 |
| 18280.0 | 7.59 |
| 18285.0 | 7.584 |
| 18290.0 | 7.578 |
| 18295.0 | 7.572 |
| 18300.0 | 7.566 |
| 18305.0 | 7.561 |
| 18310.0 | 7.555 |
| 18315.0 | 7.549 |
| 18320.0 | 7.543 |
| 18325.0 | 7.537 |
| 18330.0 | 7.531 |
| 18335.0 | 7.526 |
| 18340.0 | 7.52 |
| 18345.0 | 7.514 |
| 18350.0 | 7.508 |
| 18355.0 | 7.502 |
| 18360.0 | 7.497 |
| 18365.0 | 7.491 |
| 18370.0 | 7.485 |
| 18375.0 | 7.479 |
| 18380.0 | 7.474 |
| 18385.0 | 7.468 |
| 18390.0 | 7.462 |
| 18395.0 | 7.456 |
| 18400.0 | 7.451 |
| 18405.0 | 7.445 |
| 18410.0 | 7.439 |
| 18415.0 | 7.433 |
| 18420.0 | 7.428 |
| 18425.0 | 7.422 |
| 18430.0 | 7.416 |
| 18435.0 | 7.411 |
| 18440.0 | 7.405 |
| 18445.0 | 7.399 |
| 18450.0 | 7.393 |
| 18455.0 | 7.388 |
| 18460.0 | 7.382 |
| 18465.0 | 7.376 |
| 18470.0 | 7.371 |
| 18475.0 | 7.365 |
| 18480.0 | 7.359 |
| 18485.0 | 7.354 |
| 18490.0 | 7.348 |
| 18495.0 | 7.342 |
| 18500.0 | 7.337 |
| 18505.0 | 7.331 |
| 18510.0 | 7.325 |
| 18515.0 | 7.32 |
| 18520.0 | 7.314 |
| 18525.0 | 7.308 |
| 18530.0 | 7.303 |
| 18535.0 | 7.297 |
| 18540.0 | 7.292 |
| 18545.0 | 7.286 |
| 18550.0 | 7.28 |
| 18555.0 | 7.275 |
| 18560.0 | 7.269 |
| 18565.0 | 7.264 |
| 18570.0 | 7.258 |
| 18575.0 | 7.252 |
| 18580.0 | 7.247 |
| 18585.0 | 7.241 |
| 18590.0 | 7.236 |
| 18595.0 | 7.23 |
| 18600.0 | 7.224 |
| 18605.0 | 7.219 |
| 18610.0 | 7.213 |
| 18615.0 | 7.208 |
| 18620.0 | 7.202 |
| 18625.0 | 7.197 |
| 18630.0 | 7.191 |
| 18635.0 | 7.186 |
| 18640.0 | 7.18 |
| 18645.0 | 7.175 |
| 18650.0 | 7.169 |
| 18655.0 | 7.163 |
| 18660.0 | 7.158 |
| 18665.0 | 7.152 |
| 18670.0 | 7.147 |
| 18675.0 | 7.141 |
| 18680.0 | 7.136 |
| 18685.0 | 7.13 |
| 18690.0 | 7.125 |
| 18695.0 | 7.119 |
| 18700.0 | 7.114 |
| 18705.0 | 7.108 |
| 18710.0 | 7.103 |
| 18715.0 | 7.098 |
| 18720.0 | 7.092 |
| 18725.0 | 7.087 |
| 18730.0 | 7.081 |
| 18735.0 | 7.076 |
| 18740.0 | 7.07 |
| 18745.0 | 7.065 |
| 18750.0 | 7.059 |
| 18755.0 | 7.054 |
| 18760.0 | 7.048 |
| 18765.0 | 7.043 |
| 18770.0 | 7.038 |
| 18775.0 | 7.032 |
| 18780.0 | 7.027 |
| 18785.0 | 7.021 |
| 18790.0 | 7.016 |
| 18795.0 | 7.011 |
| 18800.0 | 7.005 |
| 18805.0 | 7 |
| 18810.0 | 6.994 |
| 18815.0 | 6.989 |
| 18820.0 | 6.984 |
| 18825.0 | 6.978 |
| 18830.0 | 6.973 |
| 18835.0 | 6.967 |
| 18840.0 | 6.962 |
| 18845.0 | 6.957 |
| 18850.0 | 6.951 |
| 18855.0 | 6.946 |
| 18860.0 | 6.941 |
| 18865.0 | 6.935 |
| 18870.0 | 6.93 |
| 18875.0 | 6.925 |
| 18880.0 | 6.919 |
| 18885.0 | 6.914 |
| 18890.0 | 6.909 |
| 18895.0 | 6.903 |
| 18900.0 | 6.898 |
| 18905.0 | 6.893 |
| 18910.0 | 6.887 |
| 18915.0 | 6.882 |
| 18920.0 | 6.877 |
| 18925.0 | 6.871 |
| 18930.0 | 6.866 |
| 18935.0 | 6.861 |
| 18940.0 | 6.856 |
| 18945.0 | 6.85 |
| 18950.0 | 6.845 |
| 18955.0 | 6.84 |
| 18960.0 | 6.835 |
| 18965.0 | 6.829 |
| 18970.0 | 6.824 |
| 18975.0 | 6.819 |
| 18980.0 | 6.813 |
| 18985.0 | 6.808 |
| 18990.0 | 6.803 |
| 18995.0 | 6.798 |
| 19000.0 | 6.793 |
| 19005.0 | 6.787 |
| 19010.0 | 6.782 |
| 19015.0 | 6.777 |
| 19020.0 | 6.772 |
| 19025.0 | 6.766 |
| 19030.0 | 6.761 |
| 19035.0 | 6.756 |
| 19040.0 | 6.751 |
| 19045.0 | 6.746 |
| 19050.0 | 6.74 |
| 19055.0 | 6.735 |
| 19060.0 | 6.73 |
| 19065.0 | 6.725 |
| 19070.0 | 6.72 |
| 19075.0 | 6.714 |
| 19080.0 | 6.709 |
| 19085.0 | 6.704 |
| 19090.0 | 6.699 |
| 19095.0 | 6.694 |
| 19100.0 | 6.689 |
| 19105.0 | 6.683 |
| 19110.0 | 6.678 |
| 19115.0 | 6.673 |
| 19120.0 | 6.668 |
| 19125.0 | 6.663 |
| 19130.0 | 6.658 |
| 19135.0 | 6.653 |
| 19140.0 | 6.648 |
| 19145.0 | 6.642 |
| 19150.0 | 6.637 |
| 19155.0 | 6.632 |
| 19160.0 | 6.627 |
| 19165.0 | 6.622 |
| 19170.0 | 6.617 |
| 19175.0 | 6.612 |
| 19180.0 | 6.607 |
| 19185.0 | 6.602 |
| 19190.0 | 6.596 |
| 19195.0 | 6.591 |
| 19200.0 | 6.586 |
| 19205.0 | 6.581 |
| 19210.0 | 6.576 |
| 19215.0 | 6.571 |
| 19220.0 | 6.566 |
| 19225.0 | 6.561 |
| 19230.0 | 6.556 |
| 19235.0 | 6.551 |
| 19240.0 | 6.546 |
| 19245.0 | 6.541 |
| 19250.0 | 6.536 |
| 19255.0 | 6.531 |
| 19260.0 | 6.526 |
| 19265.0 | 6.521 |
| 19270.0 | 6.516 |
| 19275.0 | 6.511 |
| 19280.0 | 6.506 |
| 19285.0 | 6.501 |
| 19290.0 | 6.496 |
| 19295.0 | 6.491 |
| 19300.0 | 6.486 |
| 19305.0 | 6.481 |
| 19310.0 | 6.476 |
| 19315.0 | 6.471 |
| 19320.0 | 6.466 |
| 19325.0 | 6.461 |
| 19330.0 | 6.456 |
| 19335.0 | 6.451 |
| 19340.0 | 6.446 |
| 19345.0 | 6.441 |
| 19350.0 | 6.436 |
| 19355.0 | 6.431 |
| 19360.0 | 6.426 |
| 19365.0 | 6.421 |
| 19370.0 | 6.416 |
| 19375.0 | 6.411 |
| 19380.0 | 6.406 |
| 19385.0 | 6.401 |
| 19390.0 | 6.396 |
| 19395.0 | 6.391 |
| 19400.0 | 6.386 |
| 19405.0 | 6.381 |
| 19410.0 | 6.377 |
| 19415.0 | 6.372 |
| 19420.0 | 6.367 |
| 19425.0 | 6.362 |
| 19430.0 | 6.357 |
| 19435.0 | 6.352 |
| 19440.0 | 6.347 |
| 19445.0 | 6.342 |
| 19450.0 | 6.337 |
| 19455.0 | 6.332 |
| 19460.0 | 6.328 |
| 19465.0 | 6.323 |
| 19470.0 | 6.318 |
| 19475.0 | 6.313 |
| 19480.0 | 6.308 |
| 19485.0 | 6.303 |
| 19490.0 | 6.298 |
| 19495.0 | 6.294 |
| 19500.0 | 6.289 |
| 19505.0 | 6.284 |
| 19510.0 | 6.279 |
| 19515.0 | 6.274 |
| 19520.0 | 6.269 |
| 19525.0 | 6.265 |
| 19530.0 | 6.26 |
| 19535.0 | 6.255 |
| 19540.0 | 6.25 |
| 19545.0 | 6.245 |
| 19550.0 | 6.24 |
| 19555.0 | 6.236 |
| 19560.0 | 6.231 |
| 19565.0 | 6.226 |
| 19570.0 | 6.221 |
| 19575.0 | 6.216 |
| 19580.0 | 6.212 |
| 19585.0 | 6.207 |
| 19590.0 | 6.202 |
| 19595.0 | 6.197 |
| 19600.0 | 6.193 |
| 19605.0 | 6.188 |
| 19610.0 | 6.183 |
| 19615.0 | 6.178 |
| 19620.0 | 6.173 |
| 19625.0 | 6.169 |
| 19630.0 | 6.164 |
| 19635.0 | 6.159 |
| 19640.0 | 6.154 |
| 19645.0 | 6.15 |
| 19650.0 | 6.145 |
| 19655.0 | 6.14 |
| 19660.0 | 6.136 |
| 19665.0 | 6.131 |
| 19670.0 | 6.126 |
| 19675.0 | 6.121 |
| 19680.0 | 6.117 |
| 19685.0 | 6.112 |
| 19690.0 | 6.107 |
| 19695.0 | 6.102 |
| 19700.0 | 6.098 |
| 19705.0 | 6.093 |
| 19710.0 | 6.088 |
| 19715.0 | 6.084 |
| 19720.0 | 6.079 |
| 19725.0 | 6.074 |
| 19730.0 | 6.07 |
| 19735.0 | 6.065 |
| 19740.0 | 6.06 |
| 19745.0 | 6.056 |
| 19750.0 | 6.051 |
| 19755.0 | 6.046 |
| 19760.0 | 6.042 |
| 19765.0 | 6.037 |
| 19770.0 | 6.032 |
| 19775.0 | 6.028 |
| 19780.0 | 6.023 |
| 19785.0 | 6.018 |
| 19790.0 | 6.014 |
| 19795.0 | 6.009 |
| 19800.0 | 6.005 |
| 19805.0 | 6 |
| 19810.0 | 5.995 |
| 19815.0 | 5.991 |
| 19820.0 | 5.986 |
| 19825.0 | 5.981 |
| 19830.0 | 5.977 |
| 19835.0 | 5.972 |
| 19840.0 | 5.968 |
| 19845.0 | 5.963 |
| 19850.0 | 5.958 |
| 19855.0 | 5.954 |
| 19860.0 | 5.949 |
| 19865.0 | 5.945 |
| 19870.0 | 5.94 |
| 19875.0 | 5.936 |
| 19880.0 | 5.931 |
| 19885.0 | 5.926 |
| 19890.0 | 5.922 |
| 19895.0 | 5.917 |
| 19900.0 | 5.913 |
| 19905.0 | 5.908 |
| 19910.0 | 5.904 |
| 19915.0 | 5.899 |
| 19920.0 | 5.894 |
| 19925.0 | 5.89 |
| 19930.0 | 5.885 |
| 19935.0 | 5.881 |
| 19940.0 | 5.876 |
| 19945.0 | 5.872 |
| 19950.0 | 5.867 |
| 19955.0 | 5.863 |
| 19960.0 | 5.858 |
| 19965.0 | 5.854 |
| 19970.0 | 5.849 |
| 19975.0 | 5.845 |
| 19980.0 | 5.84 |
| 19985.0 | 5.836 |
| 19990.0 | 5.831 |
| 19995.0 | 5.827 |
| 20000.0 | 5.822 |